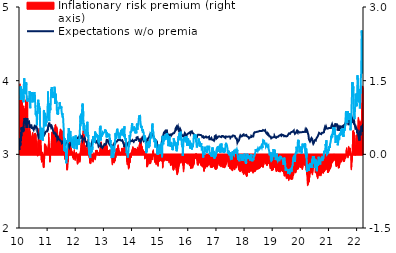
| Category | Inflationary risk premium (right axis) |
|---|---|
| 2010-01-01 | 0.437 |
| 2010-01-04 | 1.435 |
| 2010-01-05 | 0.747 |
| 2010-01-06 | 1.172 |
| 2010-01-07 | 0.792 |
| 2010-01-08 | 1.109 |
| 2010-01-11 | 0.759 |
| 2010-01-12 | 0.645 |
| 2010-01-13 | 0.78 |
| 2010-01-14 | 0.892 |
| 2010-01-15 | 1.143 |
| 2010-01-18 | 1.323 |
| 2010-01-19 | 1.054 |
| 2010-01-20 | 0.948 |
| 2010-01-21 | 1.082 |
| 2010-01-22 | 0.902 |
| 2010-01-25 | 1.047 |
| 2010-01-26 | 0.965 |
| 2010-01-27 | 1.144 |
| 2010-01-28 | 0.8 |
| 2010-01-29 | 1.093 |
| 2010-02-01 | 1.084 |
| 2010-02-02 | 0.8 |
| 2010-02-03 | 0.903 |
| 2010-02-04 | 0.911 |
| 2010-02-05 | 0.894 |
| 2010-02-08 | 0.943 |
| 2010-02-09 | 0.974 |
| 2010-02-10 | 0.783 |
| 2010-02-11 | 0.743 |
| 2010-02-12 | 0.822 |
| 2010-02-15 | 0.922 |
| 2010-02-16 | 0.69 |
| 2010-02-17 | 0.694 |
| 2010-02-18 | 0.587 |
| 2010-02-19 | 0.915 |
| 2010-02-22 | 0.988 |
| 2010-02-23 | 0.779 |
| 2010-02-24 | 0.863 |
| 2010-02-25 | 0.722 |
| 2010-02-26 | 0.819 |
| 2010-03-01 | 0.888 |
| 2010-03-02 | 0.849 |
| 2010-03-03 | 0.8 |
| 2010-03-04 | 0.919 |
| 2010-03-05 | 0.868 |
| 2010-03-08 | 0.931 |
| 2010-03-09 | 0.779 |
| 2010-03-10 | 0.929 |
| 2010-03-11 | 0.758 |
| 2010-03-12 | 0.853 |
| 2010-03-15 | 0.615 |
| 2010-03-16 | 0.704 |
| 2010-03-17 | 0.689 |
| 2010-03-18 | 0.763 |
| 2010-03-19 | 1.072 |
| 2010-03-22 | 1.111 |
| 2010-03-23 | 1.083 |
| 2010-03-24 | 0.844 |
| 2010-03-25 | 0.927 |
| 2010-03-26 | 0.847 |
| 2010-03-29 | 0.821 |
| 2010-03-30 | 0.89 |
| 2010-03-31 | 1.185 |
| 2010-04-01 | 0.962 |
| 2010-04-02 | 0.962 |
| 2010-04-05 | 0.898 |
| 2010-04-06 | 0.86 |
| 2010-04-07 | 0.802 |
| 2010-04-08 | 0.709 |
| 2010-04-09 | 0.594 |
| 2010-04-12 | 1.137 |
| 2010-04-13 | 0.524 |
| 2010-04-14 | 0.622 |
| 2010-04-15 | 0.427 |
| 2010-04-16 | 0.212 |
| 2010-04-19 | 0.152 |
| 2010-04-20 | 0.221 |
| 2010-04-21 | 0.225 |
| 2010-04-22 | 0.392 |
| 2010-04-23 | 0.349 |
| 2010-04-26 | 0.366 |
| 2010-04-27 | 0.374 |
| 2010-04-28 | 0.43 |
| 2010-04-29 | 0.397 |
| 2010-04-30 | 0.475 |
| 2010-05-03 | 0.615 |
| 2010-05-04 | 0.496 |
| 2010-05-05 | 0.511 |
| 2010-05-06 | 0.608 |
| 2010-05-07 | 0.44 |
| 2010-05-10 | 0.519 |
| 2010-05-11 | 0.434 |
| 2010-05-12 | 0.437 |
| 2010-05-13 | 0.46 |
| 2010-05-14 | 0.428 |
| 2010-05-17 | 0.461 |
| 2010-05-18 | 0.411 |
| 2010-05-19 | 0.414 |
| 2010-05-20 | 0.389 |
| 2010-05-21 | 0.389 |
| 2010-05-24 | 0.229 |
| 2010-05-25 | 0.184 |
| 2010-05-26 | 0.168 |
| 2010-05-27 | 0.237 |
| 2010-05-28 | 0.24 |
| 2010-05-31 | 0.233 |
| 2010-06-01 | 0.229 |
| 2010-06-02 | 0.276 |
| 2010-06-03 | 0.297 |
| 2010-06-04 | 0.28 |
| 2010-06-07 | 0.327 |
| 2010-06-08 | 0.325 |
| 2010-06-09 | 0.33 |
| 2010-06-10 | 0.367 |
| 2010-06-11 | 0.369 |
| 2010-06-14 | 0.385 |
| 2010-06-15 | 0.358 |
| 2010-06-16 | 0.432 |
| 2010-06-17 | 0.445 |
| 2010-06-18 | 0.415 |
| 2010-06-21 | 0.397 |
| 2010-06-22 | 0.313 |
| 2010-06-23 | 0.291 |
| 2010-06-24 | 0.332 |
| 2010-06-25 | 0.332 |
| 2010-06-28 | 0.332 |
| 2010-06-29 | 0.322 |
| 2010-06-30 | 0.313 |
| 2010-07-01 | 0.319 |
| 2010-07-02 | 0.325 |
| 2010-07-05 | 0.308 |
| 2010-07-06 | 0.307 |
| 2010-07-07 | 0.362 |
| 2010-07-08 | 0.346 |
| 2010-07-09 | 0.359 |
| 2010-07-12 | 0.369 |
| 2010-07-13 | 0.413 |
| 2010-07-14 | 0.416 |
| 2010-07-15 | 0.418 |
| 2010-07-16 | 0.418 |
| 2010-07-19 | 0.415 |
| 2010-07-20 | 0.427 |
| 2010-07-21 | 0.43 |
| 2010-07-22 | 0.418 |
| 2010-07-23 | 0.414 |
| 2010-07-26 | 0.412 |
| 2010-07-27 | 0.409 |
| 2010-07-28 | 0.392 |
| 2010-07-29 | 0.286 |
| 2010-07-30 | 0.278 |
| 2010-08-02 | 0.273 |
| 2010-08-03 | 0.169 |
| 2010-08-04 | 0.148 |
| 2010-08-05 | 0.148 |
| 2010-08-06 | 0.112 |
| 2010-08-09 | 0.156 |
| 2010-08-10 | 0.147 |
| 2010-08-11 | 0.064 |
| 2010-08-12 | 0.052 |
| 2010-08-13 | 0.091 |
| 2010-08-16 | 0.067 |
| 2010-08-17 | 0.08 |
| 2010-08-18 | 0.075 |
| 2010-08-19 | -0.002 |
| 2010-08-20 | -0.025 |
| 2010-08-23 | -0.024 |
| 2010-08-24 | 0.074 |
| 2010-08-25 | 0.127 |
| 2010-08-26 | 0.226 |
| 2010-08-27 | 0.262 |
| 2010-08-30 | 0.276 |
| 2010-08-31 | 0.316 |
| 2010-09-01 | 0.39 |
| 2010-09-02 | 0.368 |
| 2010-09-03 | 0.406 |
| 2010-09-06 | 0.46 |
| 2010-09-07 | 0.491 |
| 2010-09-08 | 0.527 |
| 2010-09-09 | 0.493 |
| 2010-09-10 | 0.489 |
| 2010-09-13 | 0.495 |
| 2010-09-14 | 0.499 |
| 2010-09-15 | 0.432 |
| 2010-09-16 | 0.477 |
| 2010-09-17 | 0.477 |
| 2010-09-20 | 0.477 |
| 2010-09-21 | 0.415 |
| 2010-09-22 | 0.408 |
| 2010-09-23 | 0.346 |
| 2010-09-24 | 0.388 |
| 2010-09-27 | 0.426 |
| 2010-09-28 | 0.424 |
| 2010-09-29 | 0.354 |
| 2010-09-30 | 0.166 |
| 2010-10-01 | 0.187 |
| 2010-10-04 | 0.115 |
| 2010-10-05 | 0.044 |
| 2010-10-06 | 0.015 |
| 2010-10-07 | -0.025 |
| 2010-10-08 | -0.108 |
| 2010-10-11 | -0.108 |
| 2010-10-12 | -0.126 |
| 2010-10-13 | -0.15 |
| 2010-10-14 | -0.147 |
| 2010-10-15 | -0.139 |
| 2010-10-18 | -0.131 |
| 2010-10-19 | -0.082 |
| 2010-10-20 | -0.012 |
| 2010-10-21 | 0.041 |
| 2010-10-22 | 0.046 |
| 2010-10-25 | -0.012 |
| 2010-10-26 | -0.063 |
| 2010-10-27 | -0.116 |
| 2010-10-28 | -0.097 |
| 2010-10-29 | -0.084 |
| 2010-11-01 | -0.084 |
| 2010-11-02 | -0.124 |
| 2010-11-03 | -0.219 |
| 2010-11-04 | -0.256 |
| 2010-11-05 | -0.254 |
| 2010-11-08 | -0.26 |
| 2010-11-09 | -0.26 |
| 2010-11-10 | -0.195 |
| 2010-11-11 | -0.159 |
| 2010-11-12 | -0.071 |
| 2010-11-15 | -0.091 |
| 2010-11-16 | -0.087 |
| 2010-11-17 | -0.08 |
| 2010-11-18 | 0.054 |
| 2010-11-19 | 0.198 |
| 2010-11-22 | 0.218 |
| 2010-11-23 | 0.167 |
| 2010-11-24 | 0.138 |
| 2010-11-25 | 0.14 |
| 2010-11-26 | 0.158 |
| 2010-11-29 | 0.163 |
| 2010-11-30 | 0.2 |
| 2010-12-01 | 0.178 |
| 2010-12-02 | 0.196 |
| 2010-12-03 | 0.163 |
| 2010-12-06 | 0.169 |
| 2010-12-07 | 0.115 |
| 2010-12-08 | 0.115 |
| 2010-12-09 | 0.145 |
| 2010-12-10 | 0.008 |
| 2010-12-13 | 0.014 |
| 2010-12-14 | 0.062 |
| 2010-12-15 | 0.123 |
| 2010-12-16 | 0.149 |
| 2010-12-17 | 0.113 |
| 2010-12-20 | 0.118 |
| 2010-12-21 | 0.079 |
| 2010-12-22 | 0.064 |
| 2010-12-23 | 0.039 |
| 2010-12-24 | 0.036 |
| 2010-12-27 | 0.061 |
| 2010-12-28 | 0.057 |
| 2010-12-29 | 0.081 |
| 2010-12-30 | 0.079 |
| 2010-12-31 | 0.079 |
| 2011-01-03 | 0.08 |
| 2011-01-04 | 0.114 |
| 2011-01-05 | 0.16 |
| 2011-01-06 | 0.136 |
| 2011-01-07 | 0.197 |
| 2011-01-10 | 0.219 |
| 2011-01-11 | 0.268 |
| 2011-01-12 | 0.432 |
| 2011-01-13 | 0.348 |
| 2011-01-14 | 0.215 |
| 2011-01-17 | 0.206 |
| 2011-01-18 | 0.136 |
| 2011-01-19 | 0.061 |
| 2011-01-20 | -0.005 |
| 2011-01-21 | 0 |
| 2011-01-24 | -0.012 |
| 2011-01-25 | -0.093 |
| 2011-01-26 | -0.12 |
| 2011-01-27 | -0.143 |
| 2011-01-28 | -0.149 |
| 2011-01-31 | -0.127 |
| 2011-02-01 | -0.094 |
| 2011-02-02 | -0.093 |
| 2011-02-03 | 0.069 |
| 2011-02-04 | 0.105 |
| 2011-02-07 | 0.125 |
| 2011-02-08 | 0.102 |
| 2011-02-09 | 0.078 |
| 2011-02-10 | 0.077 |
| 2011-02-11 | 0.09 |
| 2011-02-14 | 0.112 |
| 2011-02-15 | 0.119 |
| 2011-02-16 | 0.228 |
| 2011-02-17 | 0.275 |
| 2011-02-18 | 0.312 |
| 2011-02-21 | 0.368 |
| 2011-02-22 | 0.455 |
| 2011-02-23 | 0.415 |
| 2011-02-24 | 0.42 |
| 2011-02-25 | 0.397 |
| 2011-02-28 | 0.408 |
| 2011-03-01 | 0.444 |
| 2011-03-02 | 0.449 |
| 2011-03-03 | 0.419 |
| 2011-03-04 | 0.35 |
| 2011-03-07 | 0.331 |
| 2011-03-08 | 0.34 |
| 2011-03-09 | 0.324 |
| 2011-03-10 | 0.352 |
| 2011-03-11 | 0.387 |
| 2011-03-14 | 0.445 |
| 2011-03-15 | 0.479 |
| 2011-03-16 | 0.461 |
| 2011-03-17 | 0.478 |
| 2011-03-18 | 0.456 |
| 2011-03-21 | 0.472 |
| 2011-03-22 | 0.46 |
| 2011-03-23 | 0.472 |
| 2011-03-24 | 0.461 |
| 2011-03-25 | 0.479 |
| 2011-03-28 | 0.495 |
| 2011-03-29 | 0.516 |
| 2011-03-30 | 0.514 |
| 2011-03-31 | 0.484 |
| 2011-04-01 | 0.516 |
| 2011-04-04 | 0.534 |
| 2011-04-05 | 0.528 |
| 2011-04-06 | 0.554 |
| 2011-04-07 | 0.599 |
| 2011-04-08 | 0.597 |
| 2011-04-11 | 0.609 |
| 2011-04-12 | 0.498 |
| 2011-04-13 | 0.438 |
| 2011-04-14 | 0.415 |
| 2011-04-15 | 0.387 |
| 2011-04-18 | 0.408 |
| 2011-04-19 | 0.491 |
| 2011-04-20 | 0.542 |
| 2011-04-21 | 0.543 |
| 2011-04-22 | 0.543 |
| 2011-04-25 | 0.54 |
| 2011-04-26 | 0.564 |
| 2011-04-27 | 0.528 |
| 2011-04-28 | 0.495 |
| 2011-04-29 | 0.456 |
| 2011-05-02 | 0.471 |
| 2011-05-03 | 0.475 |
| 2011-05-04 | 0.451 |
| 2011-05-05 | 0.394 |
| 2011-05-06 | 0.348 |
| 2011-05-09 | 0.33 |
| 2011-05-10 | 0.357 |
| 2011-05-11 | 0.327 |
| 2011-05-12 | 0.349 |
| 2011-05-13 | 0.346 |
| 2011-05-16 | 0.337 |
| 2011-05-17 | 0.337 |
| 2011-05-18 | 0.342 |
| 2011-05-19 | 0.319 |
| 2011-05-20 | 0.297 |
| 2011-05-23 | 0.291 |
| 2011-05-24 | 0.285 |
| 2011-05-25 | 0.277 |
| 2011-05-26 | 0.286 |
| 2011-05-27 | 0.37 |
| 2011-05-30 | 0.386 |
| 2011-05-31 | 0.389 |
| 2011-06-01 | 0.386 |
| 2011-06-02 | 0.409 |
| 2011-06-03 | 0.418 |
| 2011-06-06 | 0.426 |
| 2011-06-07 | 0.431 |
| 2011-06-08 | 0.427 |
| 2011-06-09 | 0.461 |
| 2011-06-10 | 0.463 |
| 2011-06-13 | 0.514 |
| 2011-06-14 | 0.516 |
| 2011-06-15 | 0.486 |
| 2011-06-16 | 0.483 |
| 2011-06-17 | 0.49 |
| 2011-06-20 | 0.49 |
| 2011-06-21 | 0.494 |
| 2011-06-22 | 0.472 |
| 2011-06-23 | 0.459 |
| 2011-06-24 | 0.453 |
| 2011-06-27 | 0.453 |
| 2011-06-28 | 0.446 |
| 2011-06-29 | 0.444 |
| 2011-06-30 | 0.463 |
| 2011-07-01 | 0.463 |
| 2011-07-04 | 0.456 |
| 2011-07-05 | 0.478 |
| 2011-07-06 | 0.46 |
| 2011-07-07 | 0.427 |
| 2011-07-08 | 0.404 |
| 2011-07-11 | 0.388 |
| 2011-07-12 | 0.383 |
| 2011-07-13 | 0.395 |
| 2011-07-14 | 0.378 |
| 2011-07-15 | 0.374 |
| 2011-07-18 | 0.391 |
| 2011-07-19 | 0.411 |
| 2011-07-20 | 0.377 |
| 2011-07-21 | 0.364 |
| 2011-07-22 | 0.326 |
| 2011-07-25 | 0.334 |
| 2011-07-26 | 0.348 |
| 2011-07-27 | 0.333 |
| 2011-07-28 | 0.313 |
| 2011-07-29 | 0.273 |
| 2011-08-01 | 0.257 |
| 2011-08-02 | 0.23 |
| 2011-08-03 | 0.196 |
| 2011-08-04 | 0.132 |
| 2011-08-05 | 0.083 |
| 2011-08-08 | 0.064 |
| 2011-08-09 | 0.017 |
| 2011-08-10 | -0.093 |
| 2011-08-11 | -0.038 |
| 2011-08-12 | 0.017 |
| 2011-08-15 | 0.017 |
| 2011-08-16 | 0.041 |
| 2011-08-17 | 0.096 |
| 2011-08-18 | 0.055 |
| 2011-08-19 | -0.081 |
| 2011-08-22 | -0.03 |
| 2011-08-23 | -0.069 |
| 2011-08-24 | -0.071 |
| 2011-08-25 | -0.103 |
| 2011-08-26 | -0.092 |
| 2011-08-29 | -0.06 |
| 2011-08-30 | -0.079 |
| 2011-08-31 | -0.068 |
| 2011-09-01 | -0.075 |
| 2011-09-02 | -0.136 |
| 2011-09-05 | -0.236 |
| 2011-09-06 | -0.312 |
| 2011-09-07 | -0.302 |
| 2011-09-08 | -0.29 |
| 2011-09-09 | -0.249 |
| 2011-09-12 | -0.299 |
| 2011-09-13 | -0.261 |
| 2011-09-14 | -0.199 |
| 2011-09-15 | -0.155 |
| 2011-09-16 | -0.137 |
| 2011-09-19 | -0.137 |
| 2011-09-20 | -0.087 |
| 2011-09-21 | 0.013 |
| 2011-09-22 | 0.009 |
| 2011-09-23 | 0.022 |
| 2011-09-26 | -0.028 |
| 2011-09-27 | -0.025 |
| 2011-09-28 | -0.017 |
| 2011-09-29 | 0.051 |
| 2011-09-30 | 0.128 |
| 2011-10-03 | 0.117 |
| 2011-10-04 | 0.087 |
| 2011-10-05 | 0.144 |
| 2011-10-06 | 0.18 |
| 2011-10-07 | 0.235 |
| 2011-10-10 | 0.235 |
| 2011-10-11 | 0.256 |
| 2011-10-12 | 0.22 |
| 2011-10-13 | 0.2 |
| 2011-10-14 | 0.177 |
| 2011-10-17 | 0.112 |
| 2011-10-18 | 0.051 |
| 2011-10-19 | 0.038 |
| 2011-10-20 | -0.005 |
| 2011-10-21 | 0.032 |
| 2011-10-24 | 0.062 |
| 2011-10-25 | 0.054 |
| 2011-10-26 | 0.044 |
| 2011-10-27 | 0.163 |
| 2011-10-28 | 0.114 |
| 2011-10-31 | 0.114 |
| 2011-11-01 | 0.114 |
| 2011-11-02 | 0.082 |
| 2011-11-03 | 0.068 |
| 2011-11-04 | 0.06 |
| 2011-11-07 | 0.073 |
| 2011-11-08 | 0.053 |
| 2011-11-09 | 0.055 |
| 2011-11-10 | 0.042 |
| 2011-11-11 | 0.037 |
| 2011-11-14 | 0.01 |
| 2011-11-15 | -0.01 |
| 2011-11-16 | 0.029 |
| 2011-11-17 | -0.004 |
| 2011-11-18 | -0.033 |
| 2011-11-21 | 0.013 |
| 2011-11-22 | -0.042 |
| 2011-11-23 | -0.058 |
| 2011-11-24 | -0.061 |
| 2011-11-25 | -0.05 |
| 2011-11-28 | -0.053 |
| 2011-11-29 | -0.095 |
| 2011-11-30 | -0.08 |
| 2011-12-01 | 0.014 |
| 2011-12-02 | 0.023 |
| 2011-12-05 | 0.025 |
| 2011-12-06 | 0.013 |
| 2011-12-07 | 0.052 |
| 2011-12-08 | 0.052 |
| 2011-12-09 | 0.096 |
| 2011-12-12 | 0.012 |
| 2011-12-13 | -0.006 |
| 2011-12-14 | -0.018 |
| 2011-12-15 | -0.033 |
| 2011-12-16 | -0.039 |
| 2011-12-19 | -0.044 |
| 2011-12-20 | -0.093 |
| 2011-12-21 | -0.117 |
| 2011-12-22 | -0.095 |
| 2011-12-23 | -0.086 |
| 2011-12-26 | -0.085 |
| 2011-12-27 | -0.074 |
| 2011-12-28 | -0.052 |
| 2011-12-29 | -0.033 |
| 2011-12-30 | -0.034 |
| 2012-01-02 | 0.013 |
| 2012-01-03 | 0.039 |
| 2012-01-04 | 0.022 |
| 2012-01-05 | 0.04 |
| 2012-01-06 | 0.017 |
| 2012-01-09 | -0.009 |
| 2012-01-10 | -0.021 |
| 2012-01-11 | -0.019 |
| 2012-01-12 | -0.019 |
| 2012-01-13 | -0.014 |
| 2012-01-16 | -0.009 |
| 2012-01-17 | -0.07 |
| 2012-01-18 | -0.134 |
| 2012-01-19 | -0.17 |
| 2012-01-20 | -0.192 |
| 2012-01-23 | -0.186 |
| 2012-01-24 | -0.162 |
| 2012-01-25 | -0.164 |
| 2012-01-26 | -0.114 |
| 2012-01-27 | -0.048 |
| 2012-01-30 | -0.107 |
| 2012-01-31 | -0.061 |
| 2012-02-01 | -0.09 |
| 2012-02-02 | -0.062 |
| 2012-02-03 | -0.093 |
| 2012-02-06 | -0.086 |
| 2012-02-07 | -0.08 |
| 2012-02-08 | -0.093 |
| 2012-02-09 | -0.11 |
| 2012-02-10 | -0.118 |
| 2012-02-13 | -0.123 |
| 2012-02-14 | -0.108 |
| 2012-02-15 | -0.115 |
| 2012-02-16 | -0.127 |
| 2012-02-17 | -0.138 |
| 2012-02-20 | -0.151 |
| 2012-02-21 | -0.087 |
| 2012-02-22 | -0.106 |
| 2012-02-23 | -0.062 |
| 2012-02-24 | 0.019 |
| 2012-02-27 | 0.04 |
| 2012-02-28 | 0.075 |
| 2012-02-29 | 0.052 |
| 2012-03-01 | 0.04 |
| 2012-03-02 | 0.069 |
| 2012-03-05 | 0.121 |
| 2012-03-06 | 0.091 |
| 2012-03-07 | 0.126 |
| 2012-03-08 | 0.238 |
| 2012-03-09 | 0.198 |
| 2012-03-12 | 0.148 |
| 2012-03-13 | 0.181 |
| 2012-03-14 | 0.287 |
| 2012-03-15 | 0.217 |
| 2012-03-16 | 0.21 |
| 2012-03-19 | 0.258 |
| 2012-03-20 | 0.23 |
| 2012-03-21 | 0.171 |
| 2012-03-22 | 0.138 |
| 2012-03-23 | 0.16 |
| 2012-03-26 | 0.143 |
| 2012-03-27 | 0.133 |
| 2012-03-28 | 0.129 |
| 2012-03-29 | 0.195 |
| 2012-03-30 | 0.349 |
| 2012-04-02 | 0.42 |
| 2012-04-03 | 0.402 |
| 2012-04-04 | 0.438 |
| 2012-04-05 | 0.483 |
| 2012-04-06 | 0.483 |
| 2012-04-09 | 0.483 |
| 2012-04-10 | 0.427 |
| 2012-04-11 | 0.366 |
| 2012-04-12 | 0.382 |
| 2012-04-13 | 0.292 |
| 2012-04-16 | 0.226 |
| 2012-04-17 | 0.191 |
| 2012-04-18 | 0.145 |
| 2012-04-19 | 0.087 |
| 2012-04-20 | 0.149 |
| 2012-04-23 | 0.153 |
| 2012-04-24 | 0.194 |
| 2012-04-25 | 0.139 |
| 2012-04-26 | 0.137 |
| 2012-04-27 | 0.169 |
| 2012-04-30 | 0.17 |
| 2012-05-01 | 0.17 |
| 2012-05-02 | 0.104 |
| 2012-05-03 | 0.043 |
| 2012-05-04 | 0.027 |
| 2012-05-07 | 0.093 |
| 2012-05-08 | 0.093 |
| 2012-05-09 | 0.087 |
| 2012-05-10 | 0.112 |
| 2012-05-11 | 0.112 |
| 2012-05-14 | 0.13 |
| 2012-05-15 | 0.084 |
| 2012-05-16 | 0.079 |
| 2012-05-17 | 0.085 |
| 2012-05-18 | 0.128 |
| 2012-05-21 | 0.128 |
| 2012-05-22 | 0.134 |
| 2012-05-23 | 0.058 |
| 2012-05-24 | 0.045 |
| 2012-05-25 | 0.093 |
| 2012-05-28 | 0.098 |
| 2012-05-29 | 0.156 |
| 2012-05-30 | 0.131 |
| 2012-05-31 | 0.159 |
| 2012-06-01 | 0.252 |
| 2012-06-04 | 0.288 |
| 2012-06-05 | 0.31 |
| 2012-06-06 | 0.297 |
| 2012-06-07 | 0.29 |
| 2012-06-08 | 0.274 |
| 2012-06-11 | 0.243 |
| 2012-06-12 | 0.177 |
| 2012-06-13 | 0.127 |
| 2012-06-14 | 0.071 |
| 2012-06-15 | 0.064 |
| 2012-06-18 | 0.097 |
| 2012-06-19 | 0.043 |
| 2012-06-20 | 0.018 |
| 2012-06-21 | -0.055 |
| 2012-06-22 | -0.053 |
| 2012-06-25 | -0.071 |
| 2012-06-26 | -0.073 |
| 2012-06-27 | -0.136 |
| 2012-06-28 | -0.169 |
| 2012-06-29 | -0.075 |
| 2012-07-02 | -0.075 |
| 2012-07-03 | -0.013 |
| 2012-07-04 | -0.048 |
| 2012-07-05 | -0.18 |
| 2012-07-06 | -0.136 |
| 2012-07-09 | -0.126 |
| 2012-07-10 | -0.101 |
| 2012-07-11 | -0.12 |
| 2012-07-12 | -0.174 |
| 2012-07-13 | -0.087 |
| 2012-07-16 | -0.087 |
| 2012-07-17 | -0.041 |
| 2012-07-18 | -0.01 |
| 2012-07-19 | -0.093 |
| 2012-07-20 | -0.109 |
| 2012-07-23 | -0.111 |
| 2012-07-24 | -0.104 |
| 2012-07-25 | -0.103 |
| 2012-07-26 | -0.128 |
| 2012-07-27 | -0.034 |
| 2012-07-30 | -0.031 |
| 2012-07-31 | -0.123 |
| 2012-08-01 | -0.115 |
| 2012-08-02 | -0.091 |
| 2012-08-03 | -0.064 |
| 2012-08-06 | -0.116 |
| 2012-08-07 | -0.12 |
| 2012-08-08 | -0.1 |
| 2012-08-09 | -0.15 |
| 2012-08-10 | -0.131 |
| 2012-08-13 | -0.126 |
| 2012-08-14 | -0.076 |
| 2012-08-15 | -0.076 |
| 2012-08-16 | -0.011 |
| 2012-08-17 | -0.044 |
| 2012-08-20 | -0.028 |
| 2012-08-21 | 0.033 |
| 2012-08-22 | 0.011 |
| 2012-08-23 | -0.02 |
| 2012-08-24 | -0.065 |
| 2012-08-27 | -0.048 |
| 2012-08-28 | -0.035 |
| 2012-08-29 | -0.055 |
| 2012-08-30 | -0.049 |
| 2012-08-31 | -0.044 |
| 2012-09-03 | -0.072 |
| 2012-09-04 | -0.081 |
| 2012-09-05 | -0.105 |
| 2012-09-06 | -0.064 |
| 2012-09-07 | -0.076 |
| 2012-09-10 | -0.072 |
| 2012-09-11 | -0.049 |
| 2012-09-12 | 0.004 |
| 2012-09-13 | 0.028 |
| 2012-09-14 | 0.079 |
| 2012-09-17 | 0.079 |
| 2012-09-18 | 0.079 |
| 2012-09-19 | 0.079 |
| 2012-09-20 | 0.069 |
| 2012-09-21 | 0.053 |
| 2012-09-24 | 0.046 |
| 2012-09-25 | 0.042 |
| 2012-09-26 | 0.048 |
| 2012-09-27 | 0.081 |
| 2012-09-28 | 0.082 |
| 2012-10-01 | 0.08 |
| 2012-10-02 | 0.056 |
| 2012-10-03 | 0.056 |
| 2012-10-04 | 0.048 |
| 2012-10-05 | 0.044 |
| 2012-10-08 | 0.053 |
| 2012-10-09 | 0.017 |
| 2012-10-10 | 0.022 |
| 2012-10-11 | 0.042 |
| 2012-10-12 | 0.03 |
| 2012-10-15 | 0.03 |
| 2012-10-16 | 0.008 |
| 2012-10-17 | 0.006 |
| 2012-10-18 | 0.007 |
| 2012-10-19 | 0.001 |
| 2012-10-22 | 0.014 |
| 2012-10-23 | 0.009 |
| 2012-10-24 | 0.006 |
| 2012-10-25 | 0.03 |
| 2012-10-26 | -0.008 |
| 2012-10-29 | -0.01 |
| 2012-10-30 | 0 |
| 2012-10-31 | -0.003 |
| 2012-11-01 | -0.003 |
| 2012-11-02 | -0.003 |
| 2012-11-05 | 0.023 |
| 2012-11-06 | 0.043 |
| 2012-11-07 | 0.032 |
| 2012-11-08 | 0.093 |
| 2012-11-09 | 0.061 |
| 2012-11-12 | 0.078 |
| 2012-11-13 | 0.138 |
| 2012-11-14 | 0.156 |
| 2012-11-15 | 0.172 |
| 2012-11-16 | 0.222 |
| 2012-11-19 | 0.219 |
| 2012-11-20 | 0.179 |
| 2012-11-21 | 0.218 |
| 2012-11-22 | 0.238 |
| 2012-11-23 | 0.254 |
| 2012-11-26 | 0.214 |
| 2012-11-27 | 0.047 |
| 2012-11-28 | 0.002 |
| 2012-11-29 | 0.019 |
| 2012-11-30 | 0.044 |
| 2012-12-03 | 0.048 |
| 2012-12-04 | 0.065 |
| 2012-12-05 | 0.072 |
| 2012-12-06 | 0.105 |
| 2012-12-07 | 0.091 |
| 2012-12-10 | 0.112 |
| 2012-12-11 | 0.116 |
| 2012-12-12 | 0.122 |
| 2012-12-13 | 0.158 |
| 2012-12-14 | 0.143 |
| 2012-12-17 | 0.155 |
| 2012-12-18 | 0.158 |
| 2012-12-19 | 0.158 |
| 2012-12-20 | 0.171 |
| 2012-12-21 | 0.169 |
| 2012-12-24 | 0.166 |
| 2012-12-25 | 0.166 |
| 2012-12-26 | 0.148 |
| 2012-12-27 | 0.145 |
| 2012-12-28 | 0.143 |
| 2012-12-31 | 0.143 |
| 2013-01-01 | 0.143 |
| 2013-01-02 | 0.135 |
| 2013-01-03 | 0.149 |
| 2013-01-04 | 0.163 |
| 2013-01-07 | 0.158 |
| 2013-01-08 | 0.129 |
| 2013-01-09 | 0.133 |
| 2013-01-10 | 0.141 |
| 2013-01-11 | 0.149 |
| 2013-01-14 | 0.142 |
| 2013-01-15 | 0.142 |
| 2013-01-16 | 0.14 |
| 2013-01-17 | 0.138 |
| 2013-01-18 | 0.15 |
| 2013-01-21 | 0.148 |
| 2013-01-22 | 0.18 |
| 2013-01-23 | 0.192 |
| 2013-01-24 | 0.142 |
| 2013-01-25 | 0.145 |
| 2013-01-28 | 0.184 |
| 2013-01-29 | 0.197 |
| 2013-01-30 | 0.2 |
| 2013-01-31 | 0.199 |
| 2013-02-01 | 0.174 |
| 2013-02-04 | 0.166 |
| 2013-02-05 | 0.161 |
| 2013-02-06 | 0.138 |
| 2013-02-07 | 0.103 |
| 2013-02-08 | 0.078 |
| 2013-02-11 | 0.058 |
| 2013-02-12 | 0.006 |
| 2013-02-13 | 0.059 |
| 2013-02-14 | 0.078 |
| 2013-02-15 | 0.061 |
| 2013-02-18 | 0.073 |
| 2013-02-19 | 0.078 |
| 2013-02-20 | 0.079 |
| 2013-02-21 | 0.05 |
| 2013-02-22 | 0.043 |
| 2013-02-25 | 0.024 |
| 2013-02-26 | 0.016 |
| 2013-02-27 | 0.031 |
| 2013-02-28 | 0.05 |
| 2013-03-01 | 0.035 |
| 2013-03-04 | 0.041 |
| 2013-03-05 | 0.056 |
| 2013-03-06 | 0.079 |
| 2013-03-07 | 0.077 |
| 2013-03-08 | 0.064 |
| 2013-03-11 | 0.058 |
| 2013-03-12 | 0.082 |
| 2013-03-13 | 0.056 |
| 2013-03-14 | 0.058 |
| 2013-03-15 | 0.077 |
| 2013-03-18 | 0.099 |
| 2013-03-19 | 0.08 |
| 2013-03-20 | 0.07 |
| 2013-03-21 | 0.068 |
| 2013-03-22 | 0.049 |
| 2013-03-25 | 0.065 |
| 2013-03-26 | 0.056 |
| 2013-03-27 | 0.049 |
| 2013-03-28 | 0.001 |
| 2013-03-29 | 0.001 |
| 2013-04-01 | 0.03 |
| 2013-04-02 | 0.049 |
| 2013-04-03 | 0.062 |
| 2013-04-04 | 0.012 |
| 2013-04-05 | -0.028 |
| 2013-04-08 | -0.043 |
| 2013-04-09 | -0.051 |
| 2013-04-10 | -0.061 |
| 2013-04-11 | -0.062 |
| 2013-04-12 | -0.02 |
| 2013-04-15 | -0.046 |
| 2013-04-16 | -0.179 |
| 2013-04-17 | -0.208 |
| 2013-04-18 | -0.145 |
| 2013-04-19 | -0.123 |
| 2013-04-22 | -0.1 |
| 2013-04-23 | -0.097 |
| 2013-04-24 | -0.083 |
| 2013-04-25 | -0.113 |
| 2013-04-26 | -0.132 |
| 2013-04-29 | -0.148 |
| 2013-04-30 | -0.157 |
| 2013-05-01 | -0.157 |
| 2013-05-02 | -0.132 |
| 2013-05-03 | -0.098 |
| 2013-05-06 | -0.048 |
| 2013-05-07 | -0.045 |
| 2013-05-08 | -0.151 |
| 2013-05-09 | -0.168 |
| 2013-05-10 | -0.096 |
| 2013-05-13 | -0.045 |
| 2013-05-14 | -0.003 |
| 2013-05-15 | -0.019 |
| 2013-05-16 | -0.072 |
| 2013-05-17 | -0.061 |
| 2013-05-20 | -0.128 |
| 2013-05-21 | -0.128 |
| 2013-05-22 | -0.089 |
| 2013-05-23 | -0.082 |
| 2013-05-24 | -0.065 |
| 2013-05-27 | -0.073 |
| 2013-05-28 | -0.053 |
| 2013-05-29 | -0.059 |
| 2013-05-30 | -0.056 |
| 2013-05-31 | -0.034 |
| 2013-06-03 | 0.052 |
| 2013-06-04 | 0.08 |
| 2013-06-05 | 0.066 |
| 2013-06-06 | 0.114 |
| 2013-06-07 | 0.118 |
| 2013-06-10 | 0.055 |
| 2013-06-11 | 0.051 |
| 2013-06-12 | 0.045 |
| 2013-06-13 | 0.009 |
| 2013-06-14 | 0.033 |
| 2013-06-17 | 0.048 |
| 2013-06-18 | 0.071 |
| 2013-06-19 | 0.078 |
| 2013-06-20 | 0.106 |
| 2013-06-21 | 0.088 |
| 2013-06-24 | 0.101 |
| 2013-06-25 | 0.09 |
| 2013-06-26 | 0.084 |
| 2013-06-27 | 0.11 |
| 2013-06-28 | 0.175 |
| 2013-07-01 | 0.195 |
| 2013-07-02 | 0.167 |
| 2013-07-03 | 0.16 |
| 2013-07-04 | 0.156 |
| 2013-07-05 | 0.128 |
| 2013-07-08 | 0.126 |
| 2013-07-09 | 0.092 |
| 2013-07-10 | 0.061 |
| 2013-07-11 | 0.077 |
| 2013-07-12 | 0.065 |
| 2013-07-15 | 0.027 |
| 2013-07-16 | 0.027 |
| 2013-07-17 | 0.027 |
| 2013-07-18 | 0.029 |
| 2013-07-19 | 0.028 |
| 2013-07-22 | 0.02 |
| 2013-07-23 | 0.016 |
| 2013-07-24 | 0.046 |
| 2013-07-25 | 0.02 |
| 2013-07-26 | 0.012 |
| 2013-07-29 | 0.015 |
| 2013-07-30 | -0.01 |
| 2013-07-31 | 0.016 |
| 2013-08-01 | 0.046 |
| 2013-08-02 | 0.016 |
| 2013-08-05 | 0.025 |
| 2013-08-06 | 0.032 |
| 2013-08-07 | 0.04 |
| 2013-08-08 | 0.046 |
| 2013-08-09 | 0.049 |
| 2013-08-12 | 0.052 |
| 2013-08-13 | 0.04 |
| 2013-08-14 | 0.056 |
| 2013-08-15 | 0.056 |
| 2013-08-16 | 0.123 |
| 2013-08-19 | 0.119 |
| 2013-08-20 | 0.121 |
| 2013-08-21 | 0.119 |
| 2013-08-22 | 0.112 |
| 2013-08-23 | 0.091 |
| 2013-08-26 | 0.059 |
| 2013-08-27 | 0.035 |
| 2013-08-28 | 0.029 |
| 2013-08-29 | 0.052 |
| 2013-08-30 | 0.104 |
| 2013-09-02 | 0.086 |
| 2013-09-03 | 0.107 |
| 2013-09-04 | 0.072 |
| 2013-09-05 | 0.136 |
| 2013-09-06 | 0.083 |
| 2013-09-09 | 0.092 |
| 2013-09-10 | 0.115 |
| 2013-09-11 | 0.061 |
| 2013-09-12 | 0.079 |
| 2013-09-13 | 0.05 |
| 2013-09-16 | 0.058 |
| 2013-09-17 | 0.061 |
| 2013-09-18 | 0.061 |
| 2013-09-19 | 0.061 |
| 2013-09-20 | 0.061 |
| 2013-09-23 | 0.059 |
| 2013-09-24 | 0.058 |
| 2013-09-25 | 0.099 |
| 2013-09-26 | 0.152 |
| 2013-09-27 | 0.186 |
| 2013-09-30 | 0.244 |
| 2013-10-01 | 0.202 |
| 2013-10-02 | 0.161 |
| 2013-10-03 | 0.116 |
| 2013-10-04 | 0.075 |
| 2013-10-07 | 0.129 |
| 2013-10-08 | 0.101 |
| 2013-10-09 | 0.044 |
| 2013-10-10 | 0.059 |
| 2013-10-11 | 0.038 |
| 2013-10-14 | 0.042 |
| 2013-10-15 | 0.039 |
| 2013-10-16 | 0.019 |
| 2013-10-17 | 0.02 |
| 2013-10-18 | -0.022 |
| 2013-10-21 | 0.012 |
| 2013-10-22 | -0.048 |
| 2013-10-23 | -0.084 |
| 2013-10-24 | -0.125 |
| 2013-10-25 | -0.147 |
| 2013-10-28 | -0.153 |
| 2013-10-29 | -0.204 |
| 2013-10-30 | -0.196 |
| 2013-10-31 | -0.196 |
| 2013-11-01 | -0.196 |
| 2013-11-04 | -0.16 |
| 2013-11-05 | -0.16 |
| 2013-11-06 | -0.173 |
| 2013-11-07 | -0.164 |
| 2013-11-08 | -0.165 |
| 2013-11-11 | -0.163 |
| 2013-11-12 | -0.235 |
| 2013-11-13 | -0.273 |
| 2013-11-14 | -0.291 |
| 2013-11-15 | -0.26 |
| 2013-11-18 | -0.255 |
| 2013-11-19 | -0.261 |
| 2013-11-20 | -0.237 |
| 2013-11-21 | -0.182 |
| 2013-11-22 | -0.16 |
| 2013-11-25 | -0.15 |
| 2013-11-26 | -0.127 |
| 2013-11-27 | -0.151 |
| 2013-11-28 | -0.149 |
| 2013-11-29 | -0.16 |
| 2013-12-02 | -0.162 |
| 2013-12-03 | -0.091 |
| 2013-12-04 | -0.043 |
| 2013-12-05 | -0.057 |
| 2013-12-06 | 0.027 |
| 2013-12-09 | -0.007 |
| 2013-12-10 | -0.045 |
| 2013-12-11 | -0.061 |
| 2013-12-12 | -0.061 |
| 2013-12-13 | -0.043 |
| 2013-12-16 | -0.052 |
| 2013-12-17 | -0.012 |
| 2013-12-18 | -0.002 |
| 2013-12-19 | 0.012 |
| 2013-12-20 | 0.05 |
| 2013-12-23 | 0.031 |
| 2013-12-24 | 0.04 |
| 2013-12-25 | 0.04 |
| 2013-12-26 | 0.046 |
| 2013-12-27 | 0.059 |
| 2013-12-30 | 0.082 |
| 2013-12-31 | 0.082 |
| 2014-01-01 | 0.082 |
| 2014-01-02 | 0.111 |
| 2014-01-03 | 0.115 |
| 2014-01-06 | 0.103 |
| 2014-01-07 | 0.094 |
| 2014-01-08 | 0.157 |
| 2014-01-09 | 0.14 |
| 2014-01-10 | 0.129 |
| 2014-01-13 | 0.101 |
| 2014-01-14 | 0.068 |
| 2014-01-15 | 0.047 |
| 2014-01-16 | 0.047 |
| 2014-01-17 | 0.021 |
| 2014-01-20 | 0.038 |
| 2014-01-21 | 0.066 |
| 2014-01-22 | 0.043 |
| 2014-01-23 | 0.052 |
| 2014-01-24 | 0.097 |
| 2014-01-27 | 0.087 |
| 2014-01-28 | 0.047 |
| 2014-01-29 | 0.088 |
| 2014-01-30 | 0.118 |
| 2014-01-31 | 0.121 |
| 2014-02-03 | 0.105 |
| 2014-02-04 | 0.112 |
| 2014-02-05 | 0.121 |
| 2014-02-06 | 0.103 |
| 2014-02-07 | 0.113 |
| 2014-02-10 | 0.095 |
| 2014-02-11 | 0.106 |
| 2014-02-12 | 0.055 |
| 2014-02-13 | 0.1 |
| 2014-02-14 | 0.113 |
| 2014-02-17 | 0.083 |
| 2014-02-18 | 0.06 |
| 2014-02-19 | 0.031 |
| 2014-02-20 | 0.023 |
| 2014-02-21 | 0.089 |
| 2014-02-24 | 0.105 |
| 2014-02-25 | 0.098 |
| 2014-02-26 | 0.054 |
| 2014-02-27 | 0.089 |
| 2014-02-28 | 0.1 |
| 2014-03-03 | 0.029 |
| 2014-03-04 | 0.09 |
| 2014-03-05 | 0.08 |
| 2014-03-06 | 0.101 |
| 2014-03-07 | 0.067 |
| 2014-03-10 | 0.105 |
| 2014-03-11 | 0.149 |
| 2014-03-12 | 0.104 |
| 2014-03-13 | 0.123 |
| 2014-03-14 | 0.104 |
| 2014-03-17 | 0.086 |
| 2014-03-18 | 0.078 |
| 2014-03-19 | 0.041 |
| 2014-03-20 | 0.05 |
| 2014-03-21 | 0.078 |
| 2014-03-24 | 0.123 |
| 2014-03-25 | 0.117 |
| 2014-03-26 | 0.123 |
| 2014-03-27 | 0.113 |
| 2014-03-28 | 0.106 |
| 2014-03-31 | 0.13 |
| 2014-04-01 | 0.112 |
| 2014-04-02 | 0.181 |
| 2014-04-03 | 0.184 |
| 2014-04-04 | 0.208 |
| 2014-04-07 | 0.219 |
| 2014-04-08 | 0.281 |
| 2014-04-09 | 0.282 |
| 2014-04-10 | 0.259 |
| 2014-04-11 | 0.244 |
| 2014-04-14 | 0.284 |
| 2014-04-15 | 0.304 |
| 2014-04-16 | 0.319 |
| 2014-04-17 | 0.327 |
| 2014-04-18 | 0.327 |
| 2014-04-21 | 0.322 |
| 2014-04-22 | 0.309 |
| 2014-04-23 | 0.3 |
| 2014-04-24 | 0.277 |
| 2014-04-25 | 0.225 |
| 2014-04-28 | 0.207 |
| 2014-04-29 | 0.183 |
| 2014-04-30 | 0.16 |
| 2014-05-01 | 0.16 |
| 2014-05-02 | 0.156 |
| 2014-05-05 | 0.142 |
| 2014-05-06 | 0.153 |
| 2014-05-07 | 0.163 |
| 2014-05-08 | 0.11 |
| 2014-05-09 | 0.127 |
| 2014-05-12 | 0.109 |
| 2014-05-13 | 0.095 |
| 2014-05-14 | 0.092 |
| 2014-05-15 | 0.1 |
| 2014-05-16 | 0.099 |
| 2014-05-19 | 0.088 |
| 2014-05-20 | 0.046 |
| 2014-05-21 | 0.046 |
| 2014-05-22 | 0.053 |
| 2014-05-23 | 0.079 |
| 2014-05-26 | 0.057 |
| 2014-05-27 | 0.015 |
| 2014-05-28 | 0.006 |
| 2014-05-29 | 0.016 |
| 2014-05-30 | 0.022 |
| 2014-06-02 | 0.027 |
| 2014-06-03 | 0.047 |
| 2014-06-04 | 0.041 |
| 2014-06-05 | 0.06 |
| 2014-06-06 | 0.042 |
| 2014-06-09 | 0.025 |
| 2014-06-10 | -0.007 |
| 2014-06-11 | -0.055 |
| 2014-06-12 | -0.08 |
| 2014-06-13 | -0.085 |
| 2014-06-16 | -0.045 |
| 2014-06-17 | -0.019 |
| 2014-06-18 | -0.018 |
| 2014-06-19 | -0.018 |
| 2014-06-20 | 0.001 |
| 2014-06-23 | 0.006 |
| 2014-06-24 | 0.023 |
| 2014-06-25 | 0.014 |
| 2014-06-26 | 0.029 |
| 2014-06-27 | 0.016 |
| 2014-06-30 | -0.013 |
| 2014-07-01 | -0.065 |
| 2014-07-02 | -0.063 |
| 2014-07-03 | -0.056 |
| 2014-07-04 | -0.079 |
| 2014-07-07 | -0.111 |
| 2014-07-08 | -0.104 |
| 2014-07-09 | -0.217 |
| 2014-07-10 | -0.25 |
| 2014-07-11 | -0.237 |
| 2014-07-14 | -0.191 |
| 2014-07-15 | -0.234 |
| 2014-07-16 | -0.234 |
| 2014-07-17 | -0.232 |
| 2014-07-18 | -0.207 |
| 2014-07-21 | -0.206 |
| 2014-07-22 | -0.135 |
| 2014-07-23 | -0.133 |
| 2014-07-24 | -0.138 |
| 2014-07-25 | -0.142 |
| 2014-07-28 | -0.131 |
| 2014-07-29 | -0.095 |
| 2014-07-30 | -0.129 |
| 2014-07-31 | -0.115 |
| 2014-08-01 | -0.124 |
| 2014-08-04 | -0.119 |
| 2014-08-05 | -0.087 |
| 2014-08-06 | -0.107 |
| 2014-08-07 | -0.118 |
| 2014-08-08 | -0.184 |
| 2014-08-11 | -0.179 |
| 2014-08-12 | -0.165 |
| 2014-08-13 | -0.123 |
| 2014-08-14 | -0.1 |
| 2014-08-15 | -0.1 |
| 2014-08-18 | -0.103 |
| 2014-08-19 | -0.123 |
| 2014-08-20 | -0.134 |
| 2014-08-21 | -0.18 |
| 2014-08-22 | -0.15 |
| 2014-08-25 | -0.153 |
| 2014-08-26 | -0.156 |
| 2014-08-27 | -0.175 |
| 2014-08-28 | -0.147 |
| 2014-08-29 | -0.104 |
| 2014-09-01 | -0.093 |
| 2014-09-02 | -0.09 |
| 2014-09-03 | -0.084 |
| 2014-09-04 | -0.05 |
| 2014-09-05 | -0.062 |
| 2014-09-08 | -0.069 |
| 2014-09-09 | -0.073 |
| 2014-09-10 | -0.093 |
| 2014-09-11 | -0.079 |
| 2014-09-12 | -0.087 |
| 2014-09-15 | -0.104 |
| 2014-09-16 | -0.096 |
| 2014-09-17 | -0.06 |
| 2014-09-18 | -0.06 |
| 2014-09-19 | -0.06 |
| 2014-09-22 | -0.022 |
| 2014-09-23 | 0.015 |
| 2014-09-24 | 0.068 |
| 2014-09-25 | 0.054 |
| 2014-09-26 | 0.029 |
| 2014-09-29 | 0.065 |
| 2014-09-30 | 0.094 |
| 2014-10-01 | 0.06 |
| 2014-10-02 | 0.052 |
| 2014-10-03 | 0.021 |
| 2014-10-06 | -0.007 |
| 2014-10-07 | -0.013 |
| 2014-10-08 | -0.011 |
| 2014-10-09 | -0.031 |
| 2014-10-10 | -0.008 |
| 2014-10-13 | 0.002 |
| 2014-10-14 | -0.038 |
| 2014-10-15 | -0.111 |
| 2014-10-16 | -0.106 |
| 2014-10-17 | -0.082 |
| 2014-10-20 | -0.095 |
| 2014-10-21 | -0.096 |
| 2014-10-22 | -0.155 |
| 2014-10-23 | -0.149 |
| 2014-10-24 | -0.144 |
| 2014-10-27 | -0.161 |
| 2014-10-28 | -0.134 |
| 2014-10-29 | -0.123 |
| 2014-10-30 | -0.113 |
| 2014-10-31 | -0.113 |
| 2014-11-03 | -0.092 |
| 2014-11-04 | -0.108 |
| 2014-11-05 | -0.179 |
| 2014-11-06 | -0.201 |
| 2014-11-07 | -0.169 |
| 2014-11-10 | -0.144 |
| 2014-11-11 | -0.113 |
| 2014-11-12 | -0.085 |
| 2014-11-13 | -0.111 |
| 2014-11-14 | -0.105 |
| 2014-11-17 | -0.117 |
| 2014-11-18 | -0.111 |
| 2014-11-19 | -0.115 |
| 2014-11-20 | -0.143 |
| 2014-11-21 | -0.136 |
| 2014-11-24 | -0.121 |
| 2014-11-25 | -0.133 |
| 2014-11-26 | -0.121 |
| 2014-11-27 | -0.176 |
| 2014-11-28 | -0.219 |
| 2014-12-01 | -0.235 |
| 2014-12-02 | -0.2 |
| 2014-12-03 | -0.141 |
| 2014-12-04 | -0.135 |
| 2014-12-05 | -0.096 |
| 2014-12-08 | -0.096 |
| 2014-12-09 | -0.097 |
| 2014-12-10 | -0.147 |
| 2014-12-11 | -0.144 |
| 2014-12-12 | -0.137 |
| 2014-12-15 | -0.104 |
| 2014-12-16 | -0.1 |
| 2014-12-17 | -0.117 |
| 2014-12-18 | -0.082 |
| 2014-12-19 | -0.085 |
| 2014-12-22 | -0.092 |
| 2014-12-23 | -0.072 |
| 2014-12-24 | -0.041 |
| 2014-12-25 | -0.041 |
| 2014-12-26 | -0.078 |
| 2014-12-29 | -0.095 |
| 2014-12-30 | -0.109 |
| 2014-12-31 | -0.109 |
| 2015-01-01 | -0.109 |
| 2015-01-02 | -0.098 |
| 2015-01-05 | -0.101 |
| 2015-01-06 | -0.12 |
| 2015-01-07 | -0.087 |
| 2015-01-08 | -0.122 |
| 2015-01-09 | -0.098 |
| 2015-01-12 | -0.1 |
| 2015-01-13 | -0.057 |
| 2015-01-14 | -0.054 |
| 2015-01-15 | -0.08 |
| 2015-01-16 | -0.088 |
| 2015-01-19 | -0.087 |
| 2015-01-20 | -0.127 |
| 2015-01-21 | -0.135 |
| 2015-01-22 | -0.033 |
| 2015-01-23 | -0.035 |
| 2015-01-26 | -0.008 |
| 2015-01-27 | -0.059 |
| 2015-01-28 | -0.106 |
| 2015-01-29 | -0.186 |
| 2015-01-30 | -0.271 |
| 2015-02-02 | -0.25 |
| 2015-02-03 | -0.152 |
| 2015-02-04 | -0.134 |
| 2015-02-05 | -0.104 |
| 2015-02-06 | -0.023 |
| 2015-02-09 | 0.002 |
| 2015-02-10 | -0.023 |
| 2015-02-11 | -0.058 |
| 2015-02-12 | -0.062 |
| 2015-02-13 | -0.096 |
| 2015-02-16 | -0.101 |
| 2015-02-17 | -0.132 |
| 2015-02-18 | -0.087 |
| 2015-02-19 | -0.047 |
| 2015-02-20 | -0.02 |
| 2015-02-23 | -0.022 |
| 2015-02-24 | -0.029 |
| 2015-02-25 | -0.078 |
| 2015-02-26 | -0.109 |
| 2015-02-27 | -0.111 |
| 2015-03-02 | -0.079 |
| 2015-03-03 | -0.068 |
| 2015-03-04 | -0.076 |
| 2015-03-05 | -0.089 |
| 2015-03-06 | -0.083 |
| 2015-03-09 | -0.087 |
| 2015-03-10 | -0.108 |
| 2015-03-11 | -0.061 |
| 2015-03-12 | -0.084 |
| 2015-03-13 | -0.071 |
| 2015-03-16 | -0.07 |
| 2015-03-17 | -0.114 |
| 2015-03-18 | -0.101 |
| 2015-03-19 | -0.078 |
| 2015-03-20 | -0.041 |
| 2015-03-23 | -0.059 |
| 2015-03-24 | -0.057 |
| 2015-03-25 | -0.094 |
| 2015-03-26 | -0.118 |
| 2015-03-27 | -0.115 |
| 2015-03-30 | -0.1 |
| 2015-03-31 | -0.115 |
| 2015-04-01 | -0.112 |
| 2015-04-02 | -0.085 |
| 2015-04-03 | -0.085 |
| 2015-04-06 | -0.119 |
| 2015-04-07 | -0.068 |
| 2015-04-08 | -0.067 |
| 2015-04-09 | -0.084 |
| 2015-04-10 | -0.088 |
| 2015-04-13 | -0.079 |
| 2015-04-14 | -0.067 |
| 2015-04-15 | -0.041 |
| 2015-04-16 | -0.029 |
| 2015-04-17 | -0.021 |
| 2015-04-20 | -0.013 |
| 2015-04-21 | -0.115 |
| 2015-04-22 | -0.128 |
| 2015-04-23 | -0.165 |
| 2015-04-24 | -0.131 |
| 2015-04-27 | -0.127 |
| 2015-04-28 | -0.128 |
| 2015-04-29 | -0.115 |
| 2015-04-30 | -0.095 |
| 2015-05-01 | -0.095 |
| 2015-05-04 | -0.117 |
| 2015-05-05 | -0.083 |
| 2015-05-06 | -0.071 |
| 2015-05-07 | -0.094 |
| 2015-05-08 | -0.044 |
| 2015-05-11 | -0.067 |
| 2015-05-12 | -0.189 |
| 2015-05-13 | -0.205 |
| 2015-05-14 | -0.217 |
| 2015-05-15 | -0.218 |
| 2015-05-18 | -0.197 |
| 2015-05-19 | -0.158 |
| 2015-05-20 | -0.131 |
| 2015-05-21 | -0.131 |
| 2015-05-22 | -0.138 |
| 2015-05-25 | -0.178 |
| 2015-05-26 | -0.209 |
| 2015-05-27 | -0.191 |
| 2015-05-28 | -0.157 |
| 2015-05-29 | -0.174 |
| 2015-06-01 | -0.159 |
| 2015-06-02 | -0.13 |
| 2015-06-03 | -0.165 |
| 2015-06-04 | -0.169 |
| 2015-06-05 | -0.184 |
| 2015-06-08 | -0.194 |
| 2015-06-09 | -0.224 |
| 2015-06-10 | -0.216 |
| 2015-06-11 | -0.226 |
| 2015-06-12 | -0.238 |
| 2015-06-15 | -0.274 |
| 2015-06-16 | -0.301 |
| 2015-06-17 | -0.303 |
| 2015-06-18 | -0.316 |
| 2015-06-19 | -0.279 |
| 2015-06-22 | -0.305 |
| 2015-06-23 | -0.289 |
| 2015-06-24 | -0.297 |
| 2015-06-25 | -0.24 |
| 2015-06-26 | -0.238 |
| 2015-06-29 | -0.238 |
| 2015-06-30 | -0.236 |
| 2015-07-01 | -0.19 |
| 2015-07-02 | -0.141 |
| 2015-07-03 | -0.112 |
| 2015-07-06 | -0.164 |
| 2015-07-07 | -0.184 |
| 2015-07-08 | -0.18 |
| 2015-07-09 | -0.186 |
| 2015-07-10 | -0.161 |
| 2015-07-13 | -0.218 |
| 2015-07-14 | -0.246 |
| 2015-07-15 | -0.247 |
| 2015-07-16 | -0.247 |
| 2015-07-17 | -0.254 |
| 2015-07-20 | -0.261 |
| 2015-07-21 | -0.205 |
| 2015-07-22 | -0.247 |
| 2015-07-23 | -0.246 |
| 2015-07-24 | -0.268 |
| 2015-07-27 | -0.314 |
| 2015-07-28 | -0.307 |
| 2015-07-29 | -0.329 |
| 2015-07-30 | -0.295 |
| 2015-07-31 | -0.341 |
| 2015-08-03 | -0.326 |
| 2015-08-04 | -0.32 |
| 2015-08-05 | -0.368 |
| 2015-08-06 | -0.407 |
| 2015-08-07 | -0.401 |
| 2015-08-10 | -0.378 |
| 2015-08-11 | -0.375 |
| 2015-08-12 | -0.381 |
| 2015-08-13 | -0.354 |
| 2015-08-14 | -0.334 |
| 2015-08-17 | -0.34 |
| 2015-08-18 | -0.318 |
| 2015-08-19 | -0.264 |
| 2015-08-20 | -0.282 |
| 2015-08-21 | -0.241 |
| 2015-08-24 | -0.237 |
| 2015-08-25 | -0.282 |
| 2015-08-26 | -0.249 |
| 2015-08-27 | -0.228 |
| 2015-08-28 | -0.205 |
| 2015-08-31 | -0.199 |
| 2015-09-01 | -0.18 |
| 2015-09-02 | -0.14 |
| 2015-09-03 | -0.194 |
| 2015-09-04 | -0.188 |
| 2015-09-07 | -0.171 |
| 2015-09-08 | -0.138 |
| 2015-09-09 | -0.138 |
| 2015-09-10 | -0.149 |
| 2015-09-11 | -0.104 |
| 2015-09-14 | -0.071 |
| 2015-09-15 | -0.105 |
| 2015-09-16 | -0.123 |
| 2015-09-17 | -0.121 |
| 2015-09-18 | -0.121 |
| 2015-09-21 | -0.157 |
| 2015-09-22 | -0.169 |
| 2015-09-23 | -0.147 |
| 2015-09-24 | -0.159 |
| 2015-09-25 | -0.115 |
| 2015-09-28 | -0.078 |
| 2015-09-29 | -0.104 |
| 2015-09-30 | -0.053 |
| 2015-10-01 | -0.079 |
| 2015-10-02 | -0.089 |
| 2015-10-05 | -0.088 |
| 2015-10-06 | -0.079 |
| 2015-10-07 | -0.122 |
| 2015-10-08 | -0.089 |
| 2015-10-09 | -0.124 |
| 2015-10-12 | -0.124 |
| 2015-10-13 | -0.104 |
| 2015-10-14 | -0.132 |
| 2015-10-15 | -0.175 |
| 2015-10-16 | -0.189 |
| 2015-10-19 | -0.199 |
| 2015-10-20 | -0.215 |
| 2015-10-21 | -0.181 |
| 2015-10-22 | -0.18 |
| 2015-10-23 | -0.2 |
| 2015-10-26 | -0.23 |
| 2015-10-27 | -0.284 |
| 2015-10-28 | -0.348 |
| 2015-10-29 | -0.315 |
| 2015-10-30 | -0.284 |
| 2015-11-02 | -0.206 |
| 2015-11-03 | -0.213 |
| 2015-11-04 | -0.184 |
| 2015-11-05 | -0.154 |
| 2015-11-06 | -0.117 |
| 2015-11-09 | -0.119 |
| 2015-11-10 | -0.09 |
| 2015-11-11 | -0.066 |
| 2015-11-12 | -0.073 |
| 2015-11-13 | -0.095 |
| 2015-11-16 | -0.11 |
| 2015-11-17 | -0.142 |
| 2015-11-18 | -0.124 |
| 2015-11-19 | -0.133 |
| 2015-11-20 | -0.153 |
| 2015-11-23 | -0.147 |
| 2015-11-24 | -0.15 |
| 2015-11-25 | -0.154 |
| 2015-11-26 | -0.131 |
| 2015-11-27 | -0.09 |
| 2015-11-30 | -0.138 |
| 2015-12-01 | -0.129 |
| 2015-12-02 | -0.102 |
| 2015-12-03 | -0.126 |
| 2015-12-04 | -0.132 |
| 2015-12-07 | -0.17 |
| 2015-12-08 | -0.17 |
| 2015-12-09 | -0.132 |
| 2015-12-10 | -0.127 |
| 2015-12-11 | -0.124 |
| 2015-12-14 | -0.117 |
| 2015-12-15 | -0.053 |
| 2015-12-16 | -0.055 |
| 2015-12-17 | -0.101 |
| 2015-12-18 | -0.13 |
| 2015-12-21 | -0.141 |
| 2015-12-22 | -0.151 |
| 2015-12-23 | -0.191 |
| 2015-12-24 | -0.136 |
| 2015-12-25 | -0.136 |
| 2015-12-28 | -0.142 |
| 2015-12-29 | -0.138 |
| 2015-12-30 | -0.143 |
| 2015-12-31 | -0.143 |
| 2016-01-01 | -0.143 |
| 2016-01-04 | -0.118 |
| 2016-01-05 | -0.092 |
| 2016-01-06 | -0.151 |
| 2016-01-07 | -0.156 |
| 2016-01-08 | -0.18 |
| 2016-01-11 | -0.188 |
| 2016-01-12 | -0.204 |
| 2016-01-13 | -0.183 |
| 2016-01-14 | -0.218 |
| 2016-01-15 | -0.211 |
| 2016-01-18 | -0.222 |
| 2016-01-19 | -0.19 |
| 2016-01-20 | -0.193 |
| 2016-01-21 | -0.161 |
| 2016-01-22 | -0.165 |
| 2016-01-25 | -0.144 |
| 2016-01-26 | -0.197 |
| 2016-01-27 | -0.193 |
| 2016-01-28 | -0.237 |
| 2016-01-29 | -0.275 |
| 2016-02-01 | -0.28 |
| 2016-02-02 | -0.274 |
| 2016-02-03 | -0.264 |
| 2016-02-04 | -0.244 |
| 2016-02-05 | -0.233 |
| 2016-02-08 | -0.2 |
| 2016-02-09 | -0.176 |
| 2016-02-10 | -0.182 |
| 2016-02-11 | -0.241 |
| 2016-02-12 | -0.241 |
| 2016-02-15 | -0.231 |
| 2016-02-16 | -0.219 |
| 2016-02-17 | -0.199 |
| 2016-02-18 | -0.227 |
| 2016-02-19 | -0.233 |
| 2016-02-22 | -0.244 |
| 2016-02-23 | -0.255 |
| 2016-02-24 | -0.273 |
| 2016-02-25 | -0.232 |
| 2016-02-26 | -0.224 |
| 2016-02-29 | -0.211 |
| 2016-03-01 | -0.194 |
| 2016-03-02 | -0.177 |
| 2016-03-03 | -0.177 |
| 2016-03-04 | -0.198 |
| 2016-03-07 | -0.207 |
| 2016-03-08 | -0.214 |
| 2016-03-09 | -0.181 |
| 2016-03-10 | -0.186 |
| 2016-03-11 | -0.167 |
| 2016-03-14 | -0.155 |
| 2016-03-15 | -0.145 |
| 2016-03-16 | -0.094 |
| 2016-03-17 | -0.085 |
| 2016-03-18 | -0.038 |
| 2016-03-21 | -0.026 |
| 2016-03-22 | -0.022 |
| 2016-03-23 | -0.041 |
| 2016-03-24 | -0.06 |
| 2016-03-25 | -0.06 |
| 2016-03-28 | -0.062 |
| 2016-03-29 | -0.075 |
| 2016-03-30 | -0.078 |
| 2016-03-31 | -0.038 |
| 2016-04-01 | -0.039 |
| 2016-04-04 | -0.025 |
| 2016-04-05 | -0.034 |
| 2016-04-06 | -0.011 |
| 2016-04-07 | 0.013 |
| 2016-04-08 | 0.018 |
| 2016-04-11 | -0.01 |
| 2016-04-12 | -0.033 |
| 2016-04-13 | -0.007 |
| 2016-04-14 | -0.057 |
| 2016-04-15 | -0.079 |
| 2016-04-18 | -0.098 |
| 2016-04-19 | -0.069 |
| 2016-04-20 | -0.066 |
| 2016-04-21 | -0.073 |
| 2016-04-22 | -0.121 |
| 2016-04-25 | -0.174 |
| 2016-04-26 | -0.2 |
| 2016-04-27 | -0.202 |
| 2016-04-28 | -0.19 |
| 2016-04-29 | -0.186 |
| 2016-05-02 | -0.201 |
| 2016-05-03 | -0.215 |
| 2016-05-04 | -0.204 |
| 2016-05-05 | -0.196 |
| 2016-05-06 | -0.198 |
| 2016-05-09 | -0.166 |
| 2016-05-10 | -0.174 |
| 2016-05-11 | -0.16 |
| 2016-05-12 | -0.177 |
| 2016-05-13 | -0.169 |
| 2016-05-16 | -0.144 |
| 2016-05-17 | -0.152 |
| 2016-05-18 | -0.147 |
| 2016-05-19 | -0.111 |
| 2016-05-20 | -0.104 |
| 2016-05-23 | -0.073 |
| 2016-05-24 | -0.079 |
| 2016-05-25 | -0.121 |
| 2016-05-26 | -0.159 |
| 2016-05-27 | -0.148 |
| 2016-05-30 | -0.156 |
| 2016-05-31 | -0.149 |
| 2016-06-01 | -0.137 |
| 2016-06-02 | -0.169 |
| 2016-06-03 | -0.173 |
| 2016-06-06 | -0.175 |
| 2016-06-07 | -0.134 |
| 2016-06-08 | -0.188 |
| 2016-06-09 | -0.196 |
| 2016-06-10 | -0.21 |
| 2016-06-13 | -0.202 |
| 2016-06-14 | -0.217 |
| 2016-06-15 | -0.206 |
| 2016-06-16 | -0.224 |
| 2016-06-17 | -0.227 |
| 2016-06-20 | -0.225 |
| 2016-06-21 | -0.175 |
| 2016-06-22 | -0.174 |
| 2016-06-23 | -0.15 |
| 2016-06-24 | -0.182 |
| 2016-06-27 | -0.182 |
| 2016-06-28 | -0.197 |
| 2016-06-29 | -0.185 |
| 2016-06-30 | -0.236 |
| 2016-07-01 | -0.25 |
| 2016-07-04 | -0.229 |
| 2016-07-05 | -0.224 |
| 2016-07-06 | -0.184 |
| 2016-07-07 | -0.191 |
| 2016-07-08 | -0.183 |
| 2016-07-11 | -0.173 |
| 2016-07-12 | -0.204 |
| 2016-07-13 | -0.211 |
| 2016-07-14 | -0.242 |
| 2016-07-15 | -0.269 |
| 2016-07-18 | -0.316 |
| 2016-07-19 | -0.327 |
| 2016-07-20 | -0.341 |
| 2016-07-21 | -0.313 |
| 2016-07-22 | -0.283 |
| 2016-07-25 | -0.247 |
| 2016-07-26 | -0.246 |
| 2016-07-27 | -0.234 |
| 2016-07-28 | -0.234 |
| 2016-07-29 | -0.256 |
| 2016-08-01 | -0.247 |
| 2016-08-02 | -0.268 |
| 2016-08-03 | -0.28 |
| 2016-08-04 | -0.236 |
| 2016-08-05 | -0.225 |
| 2016-08-08 | -0.248 |
| 2016-08-09 | -0.189 |
| 2016-08-10 | -0.151 |
| 2016-08-11 | -0.134 |
| 2016-08-12 | -0.192 |
| 2016-08-15 | -0.192 |
| 2016-08-16 | -0.197 |
| 2016-08-17 | -0.21 |
| 2016-08-18 | -0.233 |
| 2016-08-19 | -0.231 |
| 2016-08-22 | -0.23 |
| 2016-08-23 | -0.249 |
| 2016-08-24 | -0.205 |
| 2016-08-25 | -0.205 |
| 2016-08-26 | -0.216 |
| 2016-08-29 | -0.236 |
| 2016-08-30 | -0.24 |
| 2016-08-31 | -0.246 |
| 2016-09-01 | -0.224 |
| 2016-09-02 | -0.235 |
| 2016-09-05 | -0.214 |
| 2016-09-06 | -0.231 |
| 2016-09-07 | -0.225 |
| 2016-09-08 | -0.203 |
| 2016-09-09 | -0.166 |
| 2016-09-12 | -0.174 |
| 2016-09-13 | -0.138 |
| 2016-09-14 | -0.162 |
| 2016-09-15 | -0.204 |
| 2016-09-16 | -0.176 |
| 2016-09-19 | -0.176 |
| 2016-09-20 | -0.164 |
| 2016-09-21 | -0.186 |
| 2016-09-22 | -0.174 |
| 2016-09-23 | -0.181 |
| 2016-09-26 | -0.181 |
| 2016-09-27 | -0.167 |
| 2016-09-28 | -0.193 |
| 2016-09-29 | -0.194 |
| 2016-09-30 | -0.197 |
| 2016-10-03 | -0.163 |
| 2016-10-04 | -0.141 |
| 2016-10-05 | -0.163 |
| 2016-10-06 | -0.154 |
| 2016-10-07 | -0.193 |
| 2016-10-10 | -0.193 |
| 2016-10-11 | -0.235 |
| 2016-10-12 | -0.225 |
| 2016-10-13 | -0.254 |
| 2016-10-14 | -0.227 |
| 2016-10-17 | -0.227 |
| 2016-10-18 | -0.227 |
| 2016-10-19 | -0.243 |
| 2016-10-20 | -0.233 |
| 2016-10-21 | -0.257 |
| 2016-10-24 | -0.257 |
| 2016-10-25 | -0.226 |
| 2016-10-26 | -0.255 |
| 2016-10-27 | -0.256 |
| 2016-10-28 | -0.235 |
| 2016-10-31 | -0.235 |
| 2016-11-01 | -0.235 |
| 2016-11-02 | -0.23 |
| 2016-11-03 | -0.248 |
| 2016-11-04 | -0.213 |
| 2016-11-07 | -0.219 |
| 2016-11-08 | -0.257 |
| 2016-11-09 | -0.216 |
| 2016-11-10 | -0.216 |
| 2016-11-11 | -0.161 |
| 2016-11-14 | -0.193 |
| 2016-11-15 | -0.202 |
| 2016-11-16 | -0.178 |
| 2016-11-17 | -0.184 |
| 2016-11-18 | -0.149 |
| 2016-11-21 | -0.148 |
| 2016-11-22 | -0.234 |
| 2016-11-23 | -0.236 |
| 2016-11-24 | -0.2 |
| 2016-11-25 | -0.176 |
| 2016-11-28 | -0.176 |
| 2016-11-29 | -0.233 |
| 2016-11-30 | -0.215 |
| 2016-12-01 | -0.153 |
| 2016-12-02 | -0.155 |
| 2016-12-05 | -0.178 |
| 2016-12-06 | -0.234 |
| 2016-12-07 | -0.262 |
| 2016-12-08 | -0.262 |
| 2016-12-09 | -0.262 |
| 2016-12-12 | -0.292 |
| 2016-12-13 | -0.292 |
| 2016-12-14 | -0.275 |
| 2016-12-15 | -0.238 |
| 2016-12-16 | -0.236 |
| 2016-12-19 | -0.238 |
| 2016-12-20 | -0.223 |
| 2016-12-21 | -0.298 |
| 2016-12-22 | -0.284 |
| 2016-12-23 | -0.258 |
| 2016-12-26 | -0.276 |
| 2016-12-27 | -0.275 |
| 2016-12-28 | -0.292 |
| 2016-12-29 | -0.282 |
| 2016-12-30 | -0.28 |
| 2017-01-02 | -0.28 |
| 2017-01-03 | -0.263 |
| 2017-01-04 | -0.244 |
| 2017-01-05 | -0.195 |
| 2017-01-06 | -0.192 |
| 2017-01-09 | -0.157 |
| 2017-01-10 | -0.158 |
| 2017-01-11 | -0.158 |
| 2017-01-12 | -0.161 |
| 2017-01-13 | -0.145 |
| 2017-01-16 | -0.171 |
| 2017-01-17 | -0.175 |
| 2017-01-18 | -0.175 |
| 2017-01-19 | -0.162 |
| 2017-01-20 | -0.178 |
| 2017-01-23 | -0.172 |
| 2017-01-24 | -0.165 |
| 2017-01-25 | -0.125 |
| 2017-01-26 | -0.135 |
| 2017-01-27 | -0.124 |
| 2017-01-30 | -0.149 |
| 2017-01-31 | -0.191 |
| 2017-02-01 | -0.198 |
| 2017-02-02 | -0.225 |
| 2017-02-03 | -0.181 |
| 2017-02-06 | -0.169 |
| 2017-02-07 | -0.134 |
| 2017-02-08 | -0.159 |
| 2017-02-09 | -0.165 |
| 2017-02-10 | -0.163 |
| 2017-02-13 | -0.165 |
| 2017-02-14 | -0.158 |
| 2017-02-15 | -0.154 |
| 2017-02-16 | -0.156 |
| 2017-02-17 | -0.171 |
| 2017-02-20 | -0.17 |
| 2017-02-21 | -0.19 |
| 2017-02-22 | -0.183 |
| 2017-02-23 | -0.21 |
| 2017-02-24 | -0.244 |
| 2017-02-27 | -0.242 |
| 2017-02-28 | -0.195 |
| 2017-03-01 | -0.174 |
| 2017-03-02 | -0.165 |
| 2017-03-03 | -0.175 |
| 2017-03-06 | -0.125 |
| 2017-03-07 | -0.148 |
| 2017-03-08 | -0.149 |
| 2017-03-09 | -0.136 |
| 2017-03-10 | -0.118 |
| 2017-03-13 | -0.098 |
| 2017-03-14 | -0.155 |
| 2017-03-15 | -0.17 |
| 2017-03-16 | -0.19 |
| 2017-03-17 | -0.168 |
| 2017-03-20 | -0.188 |
| 2017-03-21 | -0.215 |
| 2017-03-22 | -0.257 |
| 2017-03-23 | -0.241 |
| 2017-03-24 | -0.231 |
| 2017-03-27 | -0.245 |
| 2017-03-28 | -0.253 |
| 2017-03-29 | -0.253 |
| 2017-03-30 | -0.242 |
| 2017-03-31 | -0.185 |
| 2017-04-03 | -0.173 |
| 2017-04-04 | -0.201 |
| 2017-04-05 | -0.203 |
| 2017-04-06 | -0.191 |
| 2017-04-07 | -0.178 |
| 2017-04-10 | -0.176 |
| 2017-04-11 | -0.229 |
| 2017-04-12 | -0.251 |
| 2017-04-13 | -0.262 |
| 2017-04-14 | -0.262 |
| 2017-04-17 | -0.223 |
| 2017-04-18 | -0.23 |
| 2017-04-19 | -0.23 |
| 2017-04-20 | -0.212 |
| 2017-04-21 | -0.224 |
| 2017-04-24 | -0.241 |
| 2017-04-25 | -0.228 |
| 2017-04-26 | -0.184 |
| 2017-04-27 | -0.207 |
| 2017-04-28 | -0.184 |
| 2017-05-01 | -0.184 |
| 2017-05-02 | -0.195 |
| 2017-05-03 | -0.17 |
| 2017-05-04 | -0.169 |
| 2017-05-05 | -0.139 |
| 2017-05-08 | -0.126 |
| 2017-05-09 | -0.125 |
| 2017-05-10 | -0.141 |
| 2017-05-11 | -0.104 |
| 2017-05-12 | -0.098 |
| 2017-05-15 | -0.102 |
| 2017-05-16 | -0.108 |
| 2017-05-17 | -0.13 |
| 2017-05-18 | -0.142 |
| 2017-05-19 | -0.136 |
| 2017-05-22 | -0.121 |
| 2017-05-23 | -0.144 |
| 2017-05-24 | -0.112 |
| 2017-05-25 | -0.129 |
| 2017-05-26 | -0.119 |
| 2017-05-29 | -0.124 |
| 2017-05-30 | -0.123 |
| 2017-05-31 | -0.163 |
| 2017-06-01 | -0.188 |
| 2017-06-02 | -0.239 |
| 2017-06-05 | -0.222 |
| 2017-06-06 | -0.233 |
| 2017-06-07 | -0.216 |
| 2017-06-08 | -0.191 |
| 2017-06-09 | -0.19 |
| 2017-06-12 | -0.183 |
| 2017-06-13 | -0.194 |
| 2017-06-14 | -0.239 |
| 2017-06-15 | -0.204 |
| 2017-06-16 | -0.218 |
| 2017-06-19 | -0.221 |
| 2017-06-20 | -0.272 |
| 2017-06-21 | -0.275 |
| 2017-06-22 | -0.259 |
| 2017-06-23 | -0.272 |
| 2017-06-26 | -0.272 |
| 2017-06-27 | -0.272 |
| 2017-06-28 | -0.272 |
| 2017-06-29 | -0.246 |
| 2017-06-30 | -0.23 |
| 2017-07-03 | -0.23 |
| 2017-07-04 | -0.227 |
| 2017-07-05 | -0.226 |
| 2017-07-06 | -0.265 |
| 2017-07-07 | -0.287 |
| 2017-07-10 | -0.301 |
| 2017-07-11 | -0.307 |
| 2017-07-12 | -0.28 |
| 2017-07-13 | -0.295 |
| 2017-07-14 | -0.284 |
| 2017-07-17 | -0.309 |
| 2017-07-18 | -0.293 |
| 2017-07-19 | -0.283 |
| 2017-07-20 | -0.301 |
| 2017-07-21 | -0.31 |
| 2017-07-24 | -0.325 |
| 2017-07-25 | -0.317 |
| 2017-07-26 | -0.286 |
| 2017-07-27 | -0.25 |
| 2017-07-28 | -0.231 |
| 2017-07-31 | -0.209 |
| 2017-08-01 | -0.228 |
| 2017-08-02 | -0.242 |
| 2017-08-03 | -0.254 |
| 2017-08-04 | -0.262 |
| 2017-08-07 | -0.272 |
| 2017-08-08 | -0.238 |
| 2017-08-09 | -0.262 |
| 2017-08-10 | -0.278 |
| 2017-08-11 | -0.266 |
| 2017-08-14 | -0.289 |
| 2017-08-15 | -0.289 |
| 2017-08-16 | -0.282 |
| 2017-08-17 | -0.302 |
| 2017-08-18 | -0.277 |
| 2017-08-21 | -0.299 |
| 2017-08-22 | -0.302 |
| 2017-08-23 | -0.27 |
| 2017-08-24 | -0.228 |
| 2017-08-25 | -0.24 |
| 2017-08-28 | -0.24 |
| 2017-08-29 | -0.247 |
| 2017-08-30 | -0.229 |
| 2017-08-31 | -0.225 |
| 2017-09-01 | -0.219 |
| 2017-09-04 | -0.21 |
| 2017-09-05 | -0.21 |
| 2017-09-06 | -0.217 |
| 2017-09-07 | -0.271 |
| 2017-09-08 | -0.266 |
| 2017-09-11 | -0.246 |
| 2017-09-12 | -0.213 |
| 2017-09-13 | -0.208 |
| 2017-09-14 | -0.207 |
| 2017-09-15 | -0.179 |
| 2017-09-18 | -0.179 |
| 2017-09-19 | -0.179 |
| 2017-09-20 | -0.202 |
| 2017-09-21 | -0.193 |
| 2017-09-22 | -0.183 |
| 2017-09-25 | -0.199 |
| 2017-09-26 | -0.193 |
| 2017-09-27 | -0.2 |
| 2017-09-28 | -0.205 |
| 2017-09-29 | -0.181 |
| 2017-10-02 | -0.201 |
| 2017-10-03 | -0.213 |
| 2017-10-04 | -0.194 |
| 2017-10-05 | -0.189 |
| 2017-10-06 | -0.212 |
| 2017-10-09 | -0.212 |
| 2017-10-10 | -0.253 |
| 2017-10-11 | -0.259 |
| 2017-10-12 | -0.264 |
| 2017-10-13 | -0.296 |
| 2017-10-16 | -0.315 |
| 2017-10-17 | -0.295 |
| 2017-10-18 | -0.286 |
| 2017-10-19 | -0.28 |
| 2017-10-20 | -0.242 |
| 2017-10-23 | -0.259 |
| 2017-10-24 | -0.258 |
| 2017-10-25 | -0.268 |
| 2017-10-26 | -0.284 |
| 2017-10-27 | -0.284 |
| 2017-10-30 | -0.332 |
| 2017-10-31 | -0.341 |
| 2017-11-01 | -0.341 |
| 2017-11-02 | -0.325 |
| 2017-11-03 | -0.314 |
| 2017-11-06 | -0.294 |
| 2017-11-07 | -0.287 |
| 2017-11-08 | -0.252 |
| 2017-11-09 | -0.272 |
| 2017-11-10 | -0.302 |
| 2017-11-13 | -0.326 |
| 2017-11-14 | -0.305 |
| 2017-11-15 | -0.315 |
| 2017-11-16 | -0.314 |
| 2017-11-17 | -0.28 |
| 2017-11-20 | -0.283 |
| 2017-11-21 | -0.299 |
| 2017-11-22 | -0.297 |
| 2017-11-23 | -0.311 |
| 2017-11-24 | -0.301 |
| 2017-11-27 | -0.314 |
| 2017-11-28 | -0.318 |
| 2017-11-29 | -0.317 |
| 2017-11-30 | -0.34 |
| 2017-12-01 | -0.363 |
| 2017-12-04 | -0.342 |
| 2017-12-05 | -0.338 |
| 2017-12-06 | -0.306 |
| 2017-12-07 | -0.307 |
| 2017-12-08 | -0.307 |
| 2017-12-11 | -0.282 |
| 2017-12-12 | -0.305 |
| 2017-12-13 | -0.325 |
| 2017-12-14 | -0.377 |
| 2017-12-15 | -0.397 |
| 2017-12-18 | -0.399 |
| 2017-12-19 | -0.387 |
| 2017-12-20 | -0.352 |
| 2017-12-21 | -0.348 |
| 2017-12-22 | -0.333 |
| 2017-12-25 | -0.333 |
| 2017-12-26 | -0.345 |
| 2017-12-27 | -0.361 |
| 2017-12-28 | -0.345 |
| 2017-12-29 | -0.365 |
| 2018-01-01 | -0.365 |
| 2018-01-02 | -0.372 |
| 2018-01-03 | -0.35 |
| 2018-01-04 | -0.305 |
| 2018-01-05 | -0.283 |
| 2018-01-08 | -0.308 |
| 2018-01-09 | -0.34 |
| 2018-01-10 | -0.345 |
| 2018-01-11 | -0.34 |
| 2018-01-12 | -0.355 |
| 2018-01-15 | -0.363 |
| 2018-01-16 | -0.363 |
| 2018-01-17 | -0.408 |
| 2018-01-18 | -0.397 |
| 2018-01-19 | -0.406 |
| 2018-01-22 | -0.432 |
| 2018-01-23 | -0.426 |
| 2018-01-24 | -0.439 |
| 2018-01-25 | -0.436 |
| 2018-01-26 | -0.442 |
| 2018-01-29 | -0.416 |
| 2018-01-30 | -0.422 |
| 2018-01-31 | -0.403 |
| 2018-02-01 | -0.349 |
| 2018-02-02 | -0.331 |
| 2018-02-05 | -0.331 |
| 2018-02-06 | -0.329 |
| 2018-02-07 | -0.341 |
| 2018-02-08 | -0.319 |
| 2018-02-09 | -0.28 |
| 2018-02-12 | -0.271 |
| 2018-02-13 | -0.309 |
| 2018-02-14 | -0.296 |
| 2018-02-15 | -0.282 |
| 2018-02-16 | -0.291 |
| 2018-02-19 | -0.297 |
| 2018-02-20 | -0.301 |
| 2018-02-21 | -0.294 |
| 2018-02-22 | -0.36 |
| 2018-02-23 | -0.347 |
| 2018-02-26 | -0.356 |
| 2018-02-27 | -0.356 |
| 2018-02-28 | -0.34 |
| 2018-03-01 | -0.323 |
| 2018-03-02 | -0.312 |
| 2018-03-05 | -0.278 |
| 2018-03-06 | -0.272 |
| 2018-03-07 | -0.274 |
| 2018-03-08 | -0.282 |
| 2018-03-09 | -0.295 |
| 2018-03-12 | -0.289 |
| 2018-03-13 | -0.291 |
| 2018-03-14 | -0.297 |
| 2018-03-15 | -0.285 |
| 2018-03-16 | -0.293 |
| 2018-03-19 | -0.307 |
| 2018-03-20 | -0.33 |
| 2018-03-21 | -0.335 |
| 2018-03-22 | -0.337 |
| 2018-03-23 | -0.302 |
| 2018-03-26 | -0.312 |
| 2018-03-27 | -0.294 |
| 2018-03-28 | -0.279 |
| 2018-03-29 | -0.265 |
| 2018-03-30 | -0.265 |
| 2018-04-02 | -0.238 |
| 2018-04-03 | -0.274 |
| 2018-04-04 | -0.283 |
| 2018-04-05 | -0.267 |
| 2018-04-06 | -0.279 |
| 2018-04-09 | -0.316 |
| 2018-04-10 | -0.305 |
| 2018-04-11 | -0.322 |
| 2018-04-12 | -0.33 |
| 2018-04-13 | -0.319 |
| 2018-04-16 | -0.359 |
| 2018-04-17 | -0.374 |
| 2018-04-18 | -0.348 |
| 2018-04-19 | -0.35 |
| 2018-04-20 | -0.337 |
| 2018-04-23 | -0.325 |
| 2018-04-24 | -0.338 |
| 2018-04-25 | -0.314 |
| 2018-04-26 | -0.326 |
| 2018-04-27 | -0.312 |
| 2018-04-30 | -0.345 |
| 2018-05-01 | -0.345 |
| 2018-05-02 | -0.34 |
| 2018-05-03 | -0.33 |
| 2018-05-04 | -0.326 |
| 2018-05-07 | -0.304 |
| 2018-05-08 | -0.293 |
| 2018-05-09 | -0.288 |
| 2018-05-10 | -0.335 |
| 2018-05-11 | -0.323 |
| 2018-05-14 | -0.33 |
| 2018-05-15 | -0.338 |
| 2018-05-16 | -0.32 |
| 2018-05-17 | -0.315 |
| 2018-05-18 | -0.314 |
| 2018-05-21 | -0.316 |
| 2018-05-22 | -0.307 |
| 2018-05-23 | -0.314 |
| 2018-05-24 | -0.3 |
| 2018-05-25 | -0.308 |
| 2018-05-28 | -0.291 |
| 2018-05-29 | -0.254 |
| 2018-05-30 | -0.247 |
| 2018-05-31 | -0.233 |
| 2018-06-01 | -0.229 |
| 2018-06-04 | -0.234 |
| 2018-06-05 | -0.234 |
| 2018-06-06 | -0.235 |
| 2018-06-07 | -0.248 |
| 2018-06-08 | -0.255 |
| 2018-06-11 | -0.248 |
| 2018-06-12 | -0.265 |
| 2018-06-13 | -0.297 |
| 2018-06-14 | -0.278 |
| 2018-06-15 | -0.271 |
| 2018-06-18 | -0.251 |
| 2018-06-19 | -0.28 |
| 2018-06-20 | -0.292 |
| 2018-06-21 | -0.26 |
| 2018-06-22 | -0.27 |
| 2018-06-25 | -0.268 |
| 2018-06-26 | -0.284 |
| 2018-06-27 | -0.282 |
| 2018-06-28 | -0.264 |
| 2018-06-29 | -0.261 |
| 2018-07-02 | -0.262 |
| 2018-07-03 | -0.257 |
| 2018-07-04 | -0.248 |
| 2018-07-05 | -0.265 |
| 2018-07-06 | -0.278 |
| 2018-07-09 | -0.274 |
| 2018-07-10 | -0.24 |
| 2018-07-11 | -0.227 |
| 2018-07-12 | -0.235 |
| 2018-07-13 | -0.238 |
| 2018-07-16 | -0.238 |
| 2018-07-17 | -0.251 |
| 2018-07-18 | -0.258 |
| 2018-07-19 | -0.263 |
| 2018-07-20 | -0.229 |
| 2018-07-23 | -0.199 |
| 2018-07-24 | -0.222 |
| 2018-07-25 | -0.232 |
| 2018-07-26 | -0.237 |
| 2018-07-27 | -0.216 |
| 2018-07-30 | -0.214 |
| 2018-07-31 | -0.21 |
| 2018-08-01 | -0.223 |
| 2018-08-02 | -0.22 |
| 2018-08-03 | -0.235 |
| 2018-08-06 | -0.219 |
| 2018-08-07 | -0.208 |
| 2018-08-08 | -0.223 |
| 2018-08-09 | -0.233 |
| 2018-08-10 | -0.219 |
| 2018-08-13 | -0.217 |
| 2018-08-14 | -0.195 |
| 2018-08-15 | -0.196 |
| 2018-08-16 | -0.198 |
| 2018-08-17 | -0.213 |
| 2018-08-20 | -0.241 |
| 2018-08-21 | -0.246 |
| 2018-08-22 | -0.252 |
| 2018-08-23 | -0.241 |
| 2018-08-24 | -0.222 |
| 2018-08-27 | -0.233 |
| 2018-08-28 | -0.254 |
| 2018-08-29 | -0.225 |
| 2018-08-30 | -0.197 |
| 2018-08-31 | -0.201 |
| 2018-09-03 | -0.207 |
| 2018-09-04 | -0.169 |
| 2018-09-05 | -0.152 |
| 2018-09-06 | -0.123 |
| 2018-09-07 | -0.124 |
| 2018-09-10 | -0.123 |
| 2018-09-11 | -0.138 |
| 2018-09-12 | -0.121 |
| 2018-09-13 | -0.123 |
| 2018-09-14 | -0.133 |
| 2018-09-17 | -0.135 |
| 2018-09-18 | -0.136 |
| 2018-09-19 | -0.136 |
| 2018-09-20 | -0.136 |
| 2018-09-21 | -0.165 |
| 2018-09-24 | -0.178 |
| 2018-09-25 | -0.184 |
| 2018-09-26 | -0.159 |
| 2018-09-27 | -0.148 |
| 2018-09-28 | -0.155 |
| 2018-10-01 | -0.138 |
| 2018-10-02 | -0.176 |
| 2018-10-03 | -0.182 |
| 2018-10-04 | -0.176 |
| 2018-10-05 | -0.191 |
| 2018-10-08 | -0.161 |
| 2018-10-09 | -0.135 |
| 2018-10-10 | -0.149 |
| 2018-10-11 | -0.156 |
| 2018-10-12 | -0.211 |
| 2018-10-15 | -0.213 |
| 2018-10-16 | -0.219 |
| 2018-10-17 | -0.207 |
| 2018-10-18 | -0.198 |
| 2018-10-19 | -0.183 |
| 2018-10-22 | -0.188 |
| 2018-10-23 | -0.167 |
| 2018-10-24 | -0.176 |
| 2018-10-25 | -0.162 |
| 2018-10-26 | -0.162 |
| 2018-10-29 | -0.166 |
| 2018-10-30 | -0.158 |
| 2018-10-31 | -0.172 |
| 2018-11-01 | -0.173 |
| 2018-11-02 | -0.174 |
| 2018-11-05 | -0.152 |
| 2018-11-06 | -0.168 |
| 2018-11-07 | -0.173 |
| 2018-11-08 | -0.151 |
| 2018-11-09 | -0.156 |
| 2018-11-12 | -0.158 |
| 2018-11-13 | -0.166 |
| 2018-11-14 | -0.183 |
| 2018-11-15 | -0.179 |
| 2018-11-16 | -0.194 |
| 2018-11-19 | -0.196 |
| 2018-11-20 | -0.214 |
| 2018-11-21 | -0.21 |
| 2018-11-22 | -0.204 |
| 2018-11-23 | -0.209 |
| 2018-11-26 | -0.198 |
| 2018-11-27 | -0.247 |
| 2018-11-28 | -0.278 |
| 2018-11-29 | -0.279 |
| 2018-11-30 | -0.279 |
| 2018-12-03 | -0.242 |
| 2018-12-04 | -0.26 |
| 2018-12-05 | -0.237 |
| 2018-12-06 | -0.242 |
| 2018-12-07 | -0.231 |
| 2018-12-10 | -0.208 |
| 2018-12-11 | -0.21 |
| 2018-12-12 | -0.21 |
| 2018-12-13 | -0.275 |
| 2018-12-14 | -0.321 |
| 2018-12-17 | -0.295 |
| 2018-12-18 | -0.317 |
| 2018-12-19 | -0.28 |
| 2018-12-20 | -0.304 |
| 2018-12-21 | -0.303 |
| 2018-12-24 | -0.303 |
| 2018-12-25 | -0.303 |
| 2018-12-26 | -0.316 |
| 2018-12-27 | -0.302 |
| 2018-12-28 | -0.299 |
| 2018-12-31 | -0.301 |
| 2019-01-01 | -0.302 |
| 2019-01-02 | -0.304 |
| 2019-01-03 | -0.269 |
| 2019-01-04 | -0.282 |
| 2019-01-07 | -0.276 |
| 2019-01-08 | -0.262 |
| 2019-01-09 | -0.243 |
| 2019-01-10 | -0.223 |
| 2019-01-11 | -0.2 |
| 2019-01-14 | -0.198 |
| 2019-01-15 | -0.176 |
| 2019-01-16 | -0.16 |
| 2019-01-17 | -0.145 |
| 2019-01-18 | -0.159 |
| 2019-01-21 | -0.183 |
| 2019-01-22 | -0.256 |
| 2019-01-23 | -0.255 |
| 2019-01-24 | -0.251 |
| 2019-01-25 | -0.228 |
| 2019-01-28 | -0.204 |
| 2019-01-29 | -0.203 |
| 2019-01-30 | -0.209 |
| 2019-01-31 | -0.221 |
| 2019-02-01 | -0.215 |
| 2019-02-04 | -0.178 |
| 2019-02-05 | -0.165 |
| 2019-02-06 | -0.198 |
| 2019-02-07 | -0.213 |
| 2019-02-08 | -0.276 |
| 2019-02-11 | -0.299 |
| 2019-02-12 | -0.304 |
| 2019-02-13 | -0.34 |
| 2019-02-14 | -0.336 |
| 2019-02-15 | -0.338 |
| 2019-02-18 | -0.324 |
| 2019-02-19 | -0.316 |
| 2019-02-20 | -0.317 |
| 2019-02-21 | -0.293 |
| 2019-02-22 | -0.29 |
| 2019-02-25 | -0.27 |
| 2019-02-26 | -0.26 |
| 2019-02-27 | -0.26 |
| 2019-02-28 | -0.23 |
| 2019-03-01 | -0.24 |
| 2019-03-04 | -0.249 |
| 2019-03-05 | -0.258 |
| 2019-03-06 | -0.279 |
| 2019-03-07 | -0.306 |
| 2019-03-08 | -0.329 |
| 2019-03-11 | -0.317 |
| 2019-03-12 | -0.327 |
| 2019-03-13 | -0.338 |
| 2019-03-14 | -0.335 |
| 2019-03-15 | -0.333 |
| 2019-03-18 | -0.329 |
| 2019-03-19 | -0.341 |
| 2019-03-20 | -0.332 |
| 2019-03-21 | -0.322 |
| 2019-03-22 | -0.317 |
| 2019-03-25 | -0.274 |
| 2019-03-26 | -0.301 |
| 2019-03-27 | -0.318 |
| 2019-03-28 | -0.326 |
| 2019-03-29 | -0.334 |
| 2019-04-01 | -0.345 |
| 2019-04-02 | -0.346 |
| 2019-04-03 | -0.35 |
| 2019-04-04 | -0.34 |
| 2019-04-05 | -0.335 |
| 2019-04-08 | -0.286 |
| 2019-04-09 | -0.303 |
| 2019-04-10 | -0.299 |
| 2019-04-11 | -0.297 |
| 2019-04-12 | -0.278 |
| 2019-04-15 | -0.303 |
| 2019-04-16 | -0.302 |
| 2019-04-17 | -0.308 |
| 2019-04-18 | -0.295 |
| 2019-04-19 | -0.295 |
| 2019-04-22 | -0.292 |
| 2019-04-23 | -0.296 |
| 2019-04-24 | -0.301 |
| 2019-04-25 | -0.318 |
| 2019-04-26 | -0.31 |
| 2019-04-29 | -0.323 |
| 2019-04-30 | -0.333 |
| 2019-05-01 | -0.333 |
| 2019-05-02 | -0.319 |
| 2019-05-03 | -0.318 |
| 2019-05-06 | -0.329 |
| 2019-05-07 | -0.319 |
| 2019-05-08 | -0.33 |
| 2019-05-09 | -0.332 |
| 2019-05-10 | -0.326 |
| 2019-05-13 | -0.346 |
| 2019-05-14 | -0.349 |
| 2019-05-15 | -0.333 |
| 2019-05-16 | -0.34 |
| 2019-05-17 | -0.348 |
| 2019-05-20 | -0.353 |
| 2019-05-21 | -0.354 |
| 2019-05-22 | -0.355 |
| 2019-05-23 | -0.355 |
| 2019-05-24 | -0.381 |
| 2019-05-27 | -0.348 |
| 2019-05-28 | -0.377 |
| 2019-05-29 | -0.435 |
| 2019-05-30 | -0.422 |
| 2019-05-31 | -0.429 |
| 2019-06-03 | -0.41 |
| 2019-06-04 | -0.358 |
| 2019-06-05 | -0.343 |
| 2019-06-06 | -0.315 |
| 2019-06-07 | -0.31 |
| 2019-06-10 | -0.343 |
| 2019-06-11 | -0.342 |
| 2019-06-12 | -0.344 |
| 2019-06-13 | -0.339 |
| 2019-06-14 | -0.344 |
| 2019-06-17 | -0.353 |
| 2019-06-18 | -0.372 |
| 2019-06-19 | -0.387 |
| 2019-06-20 | -0.425 |
| 2019-06-21 | -0.425 |
| 2019-06-24 | -0.451 |
| 2019-06-25 | -0.487 |
| 2019-06-26 | -0.465 |
| 2019-06-27 | -0.455 |
| 2019-06-28 | -0.442 |
| 2019-07-01 | -0.452 |
| 2019-07-02 | -0.44 |
| 2019-07-03 | -0.46 |
| 2019-07-04 | -0.461 |
| 2019-07-05 | -0.459 |
| 2019-07-08 | -0.466 |
| 2019-07-09 | -0.479 |
| 2019-07-10 | -0.474 |
| 2019-07-11 | -0.458 |
| 2019-07-12 | -0.451 |
| 2019-07-15 | -0.442 |
| 2019-07-16 | -0.442 |
| 2019-07-17 | -0.449 |
| 2019-07-18 | -0.458 |
| 2019-07-19 | -0.451 |
| 2019-07-22 | -0.461 |
| 2019-07-23 | -0.47 |
| 2019-07-24 | -0.477 |
| 2019-07-25 | -0.526 |
| 2019-07-26 | -0.511 |
| 2019-07-29 | -0.481 |
| 2019-07-30 | -0.448 |
| 2019-07-31 | -0.433 |
| 2019-08-01 | -0.442 |
| 2019-08-02 | -0.446 |
| 2019-08-05 | -0.452 |
| 2019-08-06 | -0.46 |
| 2019-08-07 | -0.476 |
| 2019-08-08 | -0.47 |
| 2019-08-09 | -0.453 |
| 2019-08-12 | -0.451 |
| 2019-08-13 | -0.46 |
| 2019-08-14 | -0.484 |
| 2019-08-15 | -0.484 |
| 2019-08-16 | -0.476 |
| 2019-08-19 | -0.469 |
| 2019-08-20 | -0.462 |
| 2019-08-21 | -0.467 |
| 2019-08-22 | -0.48 |
| 2019-08-23 | -0.494 |
| 2019-08-26 | -0.49 |
| 2019-08-27 | -0.501 |
| 2019-08-28 | -0.5 |
| 2019-08-29 | -0.493 |
| 2019-08-30 | -0.478 |
| 2019-09-02 | -0.475 |
| 2019-09-03 | -0.489 |
| 2019-09-04 | -0.449 |
| 2019-09-05 | -0.448 |
| 2019-09-06 | -0.45 |
| 2019-09-09 | -0.481 |
| 2019-09-10 | -0.495 |
| 2019-09-11 | -0.495 |
| 2019-09-12 | -0.474 |
| 2019-09-13 | -0.442 |
| 2019-09-16 | -0.427 |
| 2019-09-17 | -0.415 |
| 2019-09-18 | -0.415 |
| 2019-09-19 | -0.415 |
| 2019-09-20 | -0.415 |
| 2019-09-23 | -0.417 |
| 2019-09-24 | -0.405 |
| 2019-09-25 | -0.401 |
| 2019-09-26 | -0.378 |
| 2019-09-27 | -0.356 |
| 2019-09-30 | -0.33 |
| 2019-10-01 | -0.322 |
| 2019-10-02 | -0.327 |
| 2019-10-03 | -0.333 |
| 2019-10-04 | -0.329 |
| 2019-10-07 | -0.304 |
| 2019-10-08 | -0.357 |
| 2019-10-09 | -0.343 |
| 2019-10-10 | -0.322 |
| 2019-10-11 | -0.282 |
| 2019-10-14 | -0.271 |
| 2019-10-15 | -0.272 |
| 2019-10-16 | -0.303 |
| 2019-10-17 | -0.288 |
| 2019-10-18 | -0.269 |
| 2019-10-21 | -0.298 |
| 2019-10-22 | -0.322 |
| 2019-10-23 | -0.371 |
| 2019-10-24 | -0.356 |
| 2019-10-25 | -0.343 |
| 2019-10-28 | -0.309 |
| 2019-10-29 | -0.27 |
| 2019-10-30 | -0.246 |
| 2019-10-31 | -0.246 |
| 2019-11-01 | -0.246 |
| 2019-11-04 | -0.26 |
| 2019-11-05 | -0.258 |
| 2019-11-06 | -0.295 |
| 2019-11-07 | -0.261 |
| 2019-11-08 | -0.264 |
| 2019-11-11 | -0.299 |
| 2019-11-12 | -0.265 |
| 2019-11-13 | -0.207 |
| 2019-11-14 | -0.208 |
| 2019-11-15 | -0.268 |
| 2019-11-18 | -0.288 |
| 2019-11-19 | -0.278 |
| 2019-11-20 | -0.284 |
| 2019-11-21 | -0.294 |
| 2019-11-22 | -0.287 |
| 2019-11-25 | -0.279 |
| 2019-11-26 | -0.254 |
| 2019-11-27 | -0.224 |
| 2019-11-28 | -0.179 |
| 2019-11-29 | -0.138 |
| 2019-12-02 | -0.156 |
| 2019-12-03 | -0.147 |
| 2019-12-04 | -0.113 |
| 2019-12-05 | -0.128 |
| 2019-12-06 | -0.126 |
| 2019-12-09 | -0.132 |
| 2019-12-10 | -0.11 |
| 2019-12-11 | -0.096 |
| 2019-12-12 | -0.15 |
| 2019-12-13 | -0.132 |
| 2019-12-16 | -0.182 |
| 2019-12-17 | -0.211 |
| 2019-12-18 | -0.196 |
| 2019-12-19 | -0.251 |
| 2019-12-20 | -0.257 |
| 2019-12-23 | -0.259 |
| 2019-12-24 | -0.253 |
| 2019-12-25 | -0.253 |
| 2019-12-26 | -0.254 |
| 2019-12-27 | -0.256 |
| 2019-12-30 | -0.25 |
| 2019-12-31 | -0.251 |
| 2020-01-01 | -0.253 |
| 2020-01-02 | -0.24 |
| 2020-01-03 | -0.253 |
| 2020-01-06 | -0.198 |
| 2020-01-07 | -0.201 |
| 2020-01-08 | -0.225 |
| 2020-01-09 | -0.23 |
| 2020-01-10 | -0.21 |
| 2020-01-13 | -0.233 |
| 2020-01-14 | -0.249 |
| 2020-01-15 | -0.265 |
| 2020-01-16 | -0.296 |
| 2020-01-17 | -0.296 |
| 2020-01-20 | -0.26 |
| 2020-01-21 | -0.277 |
| 2020-01-22 | -0.25 |
| 2020-01-23 | -0.217 |
| 2020-01-24 | -0.193 |
| 2020-01-27 | -0.188 |
| 2020-01-28 | -0.17 |
| 2020-01-29 | -0.17 |
| 2020-01-30 | -0.168 |
| 2020-01-31 | -0.154 |
| 2020-02-03 | -0.169 |
| 2020-02-04 | -0.19 |
| 2020-02-05 | -0.174 |
| 2020-02-06 | -0.151 |
| 2020-02-07 | -0.173 |
| 2020-02-10 | -0.173 |
| 2020-02-11 | -0.21 |
| 2020-02-12 | -0.186 |
| 2020-02-13 | -0.188 |
| 2020-02-14 | -0.202 |
| 2020-02-17 | -0.201 |
| 2020-02-18 | -0.199 |
| 2020-02-19 | -0.2 |
| 2020-02-20 | -0.197 |
| 2020-02-21 | -0.214 |
| 2020-02-24 | -0.217 |
| 2020-02-25 | -0.201 |
| 2020-02-26 | -0.201 |
| 2020-02-27 | -0.192 |
| 2020-02-28 | -0.197 |
| 2020-03-02 | -0.214 |
| 2020-03-03 | -0.157 |
| 2020-03-04 | -0.174 |
| 2020-03-05 | -0.24 |
| 2020-03-06 | -0.26 |
| 2020-03-09 | -0.313 |
| 2020-03-10 | -0.309 |
| 2020-03-11 | -0.32 |
| 2020-03-12 | -0.245 |
| 2020-03-13 | -0.297 |
| 2020-03-16 | -0.326 |
| 2020-03-17 | -0.396 |
| 2020-03-18 | -0.378 |
| 2020-03-19 | -0.302 |
| 2020-03-20 | -0.414 |
| 2020-03-23 | -0.444 |
| 2020-03-24 | -0.528 |
| 2020-03-25 | -0.588 |
| 2020-03-26 | -0.63 |
| 2020-03-27 | -0.586 |
| 2020-03-30 | -0.611 |
| 2020-03-31 | -0.599 |
| 2020-04-01 | -0.57 |
| 2020-04-02 | -0.545 |
| 2020-04-03 | -0.511 |
| 2020-04-06 | -0.523 |
| 2020-04-07 | -0.539 |
| 2020-04-08 | -0.533 |
| 2020-04-09 | -0.52 |
| 2020-04-10 | -0.52 |
| 2020-04-13 | -0.553 |
| 2020-04-14 | -0.556 |
| 2020-04-15 | -0.534 |
| 2020-04-16 | -0.489 |
| 2020-04-17 | -0.464 |
| 2020-04-20 | -0.473 |
| 2020-04-21 | -0.456 |
| 2020-04-22 | -0.402 |
| 2020-04-23 | -0.389 |
| 2020-04-24 | -0.363 |
| 2020-04-27 | -0.371 |
| 2020-04-28 | -0.359 |
| 2020-04-29 | -0.36 |
| 2020-04-30 | -0.364 |
| 2020-05-01 | -0.363 |
| 2020-05-04 | -0.358 |
| 2020-05-05 | -0.324 |
| 2020-05-06 | -0.348 |
| 2020-05-07 | -0.34 |
| 2020-05-08 | -0.321 |
| 2020-05-11 | -0.301 |
| 2020-05-12 | -0.299 |
| 2020-05-13 | -0.342 |
| 2020-05-14 | -0.328 |
| 2020-05-15 | -0.351 |
| 2020-05-18 | -0.346 |
| 2020-05-19 | -0.362 |
| 2020-05-20 | -0.362 |
| 2020-05-21 | -0.364 |
| 2020-05-22 | -0.368 |
| 2020-05-25 | -0.375 |
| 2020-05-26 | -0.363 |
| 2020-05-27 | -0.409 |
| 2020-05-28 | -0.377 |
| 2020-05-29 | -0.366 |
| 2020-06-01 | -0.337 |
| 2020-06-02 | -0.276 |
| 2020-06-03 | -0.292 |
| 2020-06-04 | -0.275 |
| 2020-06-05 | -0.261 |
| 2020-06-08 | -0.239 |
| 2020-06-09 | -0.21 |
| 2020-06-10 | -0.186 |
| 2020-06-11 | -0.193 |
| 2020-06-12 | -0.172 |
| 2020-06-15 | -0.216 |
| 2020-06-16 | -0.236 |
| 2020-06-17 | -0.217 |
| 2020-06-18 | -0.256 |
| 2020-06-19 | -0.241 |
| 2020-06-22 | -0.21 |
| 2020-06-23 | -0.208 |
| 2020-06-24 | -0.201 |
| 2020-06-25 | -0.174 |
| 2020-06-26 | -0.17 |
| 2020-06-29 | -0.172 |
| 2020-06-30 | -0.178 |
| 2020-07-01 | -0.19 |
| 2020-07-02 | -0.248 |
| 2020-07-03 | -0.255 |
| 2020-07-06 | -0.365 |
| 2020-07-07 | -0.368 |
| 2020-07-08 | -0.352 |
| 2020-07-09 | -0.308 |
| 2020-07-10 | -0.276 |
| 2020-07-13 | -0.292 |
| 2020-07-14 | -0.329 |
| 2020-07-15 | -0.295 |
| 2020-07-16 | -0.295 |
| 2020-07-17 | -0.288 |
| 2020-07-20 | -0.251 |
| 2020-07-21 | -0.301 |
| 2020-07-22 | -0.34 |
| 2020-07-23 | -0.328 |
| 2020-07-24 | -0.381 |
| 2020-07-27 | -0.402 |
| 2020-07-28 | -0.407 |
| 2020-07-29 | -0.438 |
| 2020-07-30 | -0.458 |
| 2020-07-31 | -0.451 |
| 2020-08-03 | -0.473 |
| 2020-08-04 | -0.486 |
| 2020-08-05 | -0.431 |
| 2020-08-06 | -0.393 |
| 2020-08-07 | -0.344 |
| 2020-08-10 | -0.385 |
| 2020-08-11 | -0.349 |
| 2020-08-12 | -0.348 |
| 2020-08-13 | -0.407 |
| 2020-08-14 | -0.407 |
| 2020-08-17 | -0.422 |
| 2020-08-18 | -0.418 |
| 2020-08-19 | -0.402 |
| 2020-08-20 | -0.361 |
| 2020-08-21 | -0.345 |
| 2020-08-24 | -0.319 |
| 2020-08-25 | -0.3 |
| 2020-08-26 | -0.32 |
| 2020-08-27 | -0.332 |
| 2020-08-28 | -0.349 |
| 2020-08-31 | -0.388 |
| 2020-09-01 | -0.428 |
| 2020-09-02 | -0.363 |
| 2020-09-03 | -0.394 |
| 2020-09-04 | -0.386 |
| 2020-09-07 | -0.385 |
| 2020-09-08 | -0.387 |
| 2020-09-09 | -0.389 |
| 2020-09-10 | -0.386 |
| 2020-09-11 | -0.379 |
| 2020-09-14 | -0.379 |
| 2020-09-15 | -0.428 |
| 2020-09-16 | -0.386 |
| 2020-09-17 | -0.388 |
| 2020-09-18 | -0.389 |
| 2020-09-21 | -0.387 |
| 2020-09-22 | -0.385 |
| 2020-09-23 | -0.374 |
| 2020-09-24 | -0.357 |
| 2020-09-25 | -0.343 |
| 2020-09-28 | -0.33 |
| 2020-09-29 | -0.333 |
| 2020-09-30 | -0.349 |
| 2020-10-01 | -0.349 |
| 2020-10-02 | -0.361 |
| 2020-10-05 | -0.35 |
| 2020-10-06 | -0.315 |
| 2020-10-07 | -0.317 |
| 2020-10-08 | -0.325 |
| 2020-10-09 | -0.339 |
| 2020-10-12 | -0.34 |
| 2020-10-13 | -0.354 |
| 2020-10-14 | -0.373 |
| 2020-10-15 | -0.37 |
| 2020-10-16 | -0.373 |
| 2020-10-19 | -0.334 |
| 2020-10-20 | -0.316 |
| 2020-10-21 | -0.308 |
| 2020-10-22 | -0.325 |
| 2020-10-23 | -0.346 |
| 2020-10-26 | -0.336 |
| 2020-10-27 | -0.343 |
| 2020-10-28 | -0.336 |
| 2020-10-29 | -0.34 |
| 2020-10-30 | -0.327 |
| 2020-11-02 | -0.325 |
| 2020-11-03 | -0.271 |
| 2020-11-04 | -0.284 |
| 2020-11-05 | -0.294 |
| 2020-11-06 | -0.294 |
| 2020-11-09 | -0.256 |
| 2020-11-10 | -0.281 |
| 2020-11-11 | -0.291 |
| 2020-11-12 | -0.283 |
| 2020-11-13 | -0.297 |
| 2020-11-16 | -0.311 |
| 2020-11-17 | -0.307 |
| 2020-11-18 | -0.298 |
| 2020-11-19 | -0.286 |
| 2020-11-20 | -0.277 |
| 2020-11-23 | -0.232 |
| 2020-11-24 | -0.197 |
| 2020-11-25 | -0.214 |
| 2020-11-26 | -0.21 |
| 2020-11-27 | -0.222 |
| 2020-11-30 | -0.249 |
| 2020-12-01 | -0.241 |
| 2020-12-02 | -0.194 |
| 2020-12-03 | -0.188 |
| 2020-12-04 | -0.163 |
| 2020-12-07 | -0.241 |
| 2020-12-08 | -0.241 |
| 2020-12-09 | -0.268 |
| 2020-12-10 | -0.308 |
| 2020-12-11 | -0.359 |
| 2020-12-14 | -0.359 |
| 2020-12-15 | -0.354 |
| 2020-12-16 | -0.344 |
| 2020-12-17 | -0.358 |
| 2020-12-18 | -0.34 |
| 2020-12-21 | -0.347 |
| 2020-12-22 | -0.336 |
| 2020-12-23 | -0.339 |
| 2020-12-24 | -0.332 |
| 2020-12-25 | -0.333 |
| 2020-12-28 | -0.33 |
| 2020-12-29 | -0.313 |
| 2020-12-30 | -0.29 |
| 2020-12-31 | -0.291 |
| 2021-01-01 | -0.292 |
| 2021-01-04 | -0.271 |
| 2021-01-05 | -0.297 |
| 2021-01-06 | -0.247 |
| 2021-01-07 | -0.249 |
| 2021-01-08 | -0.247 |
| 2021-01-11 | -0.259 |
| 2021-01-12 | -0.26 |
| 2021-01-13 | -0.29 |
| 2021-01-14 | -0.259 |
| 2021-01-15 | -0.273 |
| 2021-01-18 | -0.271 |
| 2021-01-19 | -0.251 |
| 2021-01-20 | -0.251 |
| 2021-01-21 | -0.229 |
| 2021-01-22 | -0.221 |
| 2021-01-25 | -0.214 |
| 2021-01-26 | -0.203 |
| 2021-01-27 | -0.192 |
| 2021-01-28 | -0.186 |
| 2021-01-29 | -0.188 |
| 2021-02-01 | -0.17 |
| 2021-02-02 | -0.168 |
| 2021-02-03 | -0.125 |
| 2021-02-04 | -0.11 |
| 2021-02-05 | -0.152 |
| 2021-02-08 | -0.127 |
| 2021-02-09 | -0.147 |
| 2021-02-10 | -0.153 |
| 2021-02-11 | -0.125 |
| 2021-02-12 | -0.118 |
| 2021-02-15 | -0.107 |
| 2021-02-16 | -0.119 |
| 2021-02-17 | -0.145 |
| 2021-02-18 | -0.115 |
| 2021-02-19 | -0.078 |
| 2021-02-22 | -0.081 |
| 2021-02-23 | -0.095 |
| 2021-02-24 | -0.109 |
| 2021-02-25 | -0.114 |
| 2021-02-26 | -0.109 |
| 2021-03-01 | -0.055 |
| 2021-03-02 | 0 |
| 2021-03-03 | 0.004 |
| 2021-03-04 | 0.007 |
| 2021-03-05 | -0.019 |
| 2021-03-08 | -0.06 |
| 2021-03-09 | -0.074 |
| 2021-03-10 | -0.053 |
| 2021-03-11 | -0.071 |
| 2021-03-12 | -0.089 |
| 2021-03-15 | -0.119 |
| 2021-03-16 | -0.095 |
| 2021-03-17 | -0.062 |
| 2021-03-18 | -0.033 |
| 2021-03-19 | -0.04 |
| 2021-03-22 | -0.019 |
| 2021-03-23 | -0.019 |
| 2021-03-24 | -0.036 |
| 2021-03-25 | -0.087 |
| 2021-03-26 | -0.115 |
| 2021-03-29 | -0.155 |
| 2021-03-30 | -0.193 |
| 2021-03-31 | -0.197 |
| 2021-04-01 | -0.239 |
| 2021-04-02 | -0.239 |
| 2021-04-05 | -0.219 |
| 2021-04-06 | -0.215 |
| 2021-04-07 | -0.183 |
| 2021-04-08 | -0.163 |
| 2021-04-09 | -0.154 |
| 2021-04-12 | -0.158 |
| 2021-04-13 | -0.187 |
| 2021-04-14 | -0.222 |
| 2021-04-15 | -0.223 |
| 2021-04-16 | -0.209 |
| 2021-04-19 | -0.174 |
| 2021-04-20 | -0.191 |
| 2021-04-21 | -0.209 |
| 2021-04-22 | -0.212 |
| 2021-04-23 | -0.22 |
| 2021-04-26 | -0.212 |
| 2021-04-27 | -0.196 |
| 2021-04-28 | -0.185 |
| 2021-04-29 | -0.203 |
| 2021-04-30 | -0.273 |
| 2021-05-03 | -0.253 |
| 2021-05-04 | -0.261 |
| 2021-05-05 | -0.255 |
| 2021-05-06 | -0.247 |
| 2021-05-07 | -0.267 |
| 2021-05-10 | -0.253 |
| 2021-05-11 | -0.231 |
| 2021-05-12 | -0.206 |
| 2021-05-13 | -0.212 |
| 2021-05-14 | -0.204 |
| 2021-05-17 | -0.16 |
| 2021-05-18 | -0.179 |
| 2021-05-19 | -0.15 |
| 2021-05-20 | -0.089 |
| 2021-05-21 | -0.089 |
| 2021-05-24 | -0.101 |
| 2021-05-25 | -0.089 |
| 2021-05-26 | -0.095 |
| 2021-05-27 | -0.11 |
| 2021-05-28 | -0.134 |
| 2021-05-31 | -0.124 |
| 2021-06-01 | -0.152 |
| 2021-06-02 | -0.132 |
| 2021-06-03 | -0.11 |
| 2021-06-04 | -0.117 |
| 2021-06-07 | -0.124 |
| 2021-06-08 | -0.12 |
| 2021-06-09 | -0.129 |
| 2021-06-10 | -0.143 |
| 2021-06-11 | -0.025 |
| 2021-06-14 | -0.021 |
| 2021-06-15 | -0.022 |
| 2021-06-16 | -0.038 |
| 2021-06-17 | -0.02 |
| 2021-06-18 | -0.031 |
| 2021-06-21 | -0.031 |
| 2021-06-22 | -0.016 |
| 2021-06-23 | -0.041 |
| 2021-06-24 | -0.066 |
| 2021-06-25 | -0.106 |
| 2021-06-28 | -0.106 |
| 2021-06-29 | -0.092 |
| 2021-06-30 | -0.079 |
| 2021-07-01 | -0.053 |
| 2021-07-02 | -0.033 |
| 2021-07-05 | -0.027 |
| 2021-07-06 | -0.086 |
| 2021-07-07 | -0.108 |
| 2021-07-08 | -0.139 |
| 2021-07-09 | -0.135 |
| 2021-07-12 | -0.112 |
| 2021-07-13 | -0.106 |
| 2021-07-14 | -0.133 |
| 2021-07-15 | -0.125 |
| 2021-07-16 | -0.125 |
| 2021-07-19 | -0.112 |
| 2021-07-20 | -0.077 |
| 2021-07-21 | -0.039 |
| 2021-07-22 | -0.055 |
| 2021-07-23 | -0.032 |
| 2021-07-26 | -0.026 |
| 2021-07-27 | -0.065 |
| 2021-07-28 | -0.069 |
| 2021-07-29 | -0.073 |
| 2021-07-30 | -0.062 |
| 2021-08-02 | -0.068 |
| 2021-08-03 | -0.033 |
| 2021-08-04 | -0.004 |
| 2021-08-05 | -0.023 |
| 2021-08-06 | -0.026 |
| 2021-08-09 | -0.008 |
| 2021-08-10 | -0.021 |
| 2021-08-11 | 0.081 |
| 2021-08-12 | 0.093 |
| 2021-08-13 | 0.113 |
| 2021-08-16 | 0.135 |
| 2021-08-17 | 0.071 |
| 2021-08-18 | -0.008 |
| 2021-08-19 | 0.008 |
| 2021-08-20 | 0.042 |
| 2021-08-23 | 0.054 |
| 2021-08-24 | 0.047 |
| 2021-08-25 | 0.031 |
| 2021-08-26 | 0.024 |
| 2021-08-27 | -0.017 |
| 2021-08-30 | -0.028 |
| 2021-08-31 | -0.025 |
| 2021-09-01 | -0.065 |
| 2021-09-02 | -0.035 |
| 2021-09-03 | 0.013 |
| 2021-09-06 | 0.031 |
| 2021-09-07 | 0.019 |
| 2021-09-08 | 0.093 |
| 2021-09-09 | 0.149 |
| 2021-09-10 | 0.163 |
| 2021-09-13 | 0.059 |
| 2021-09-14 | 0.131 |
| 2021-09-15 | 0.118 |
| 2021-09-16 | 0.122 |
| 2021-09-17 | 0.122 |
| 2021-09-20 | 0.081 |
| 2021-09-21 | 0.074 |
| 2021-09-22 | 0.092 |
| 2021-09-23 | 0.087 |
| 2021-09-24 | 0.057 |
| 2021-09-27 | 0.079 |
| 2021-09-28 | 0.128 |
| 2021-09-29 | 0.121 |
| 2021-09-30 | 0.066 |
| 2021-10-01 | 0.022 |
| 2021-10-04 | 0.03 |
| 2021-10-05 | 0.017 |
| 2021-10-06 | 0.029 |
| 2021-10-07 | 0.007 |
| 2021-10-08 | 0.004 |
| 2021-10-11 | 0.004 |
| 2021-10-12 | -0.005 |
| 2021-10-13 | -0.113 |
| 2021-10-14 | -0.307 |
| 2021-10-15 | -0.274 |
| 2021-10-18 | -0.248 |
| 2021-10-19 | -0.164 |
| 2021-10-20 | -0.142 |
| 2021-10-21 | -0.116 |
| 2021-10-22 | -0.094 |
| 2021-10-25 | -0.096 |
| 2021-10-26 | -0.012 |
| 2021-10-27 | 0.046 |
| 2021-10-28 | 0.067 |
| 2021-10-29 | 0.204 |
| 2021-11-01 | 0.204 |
| 2021-11-02 | 0.278 |
| 2021-11-03 | 0.354 |
| 2021-11-04 | 0.475 |
| 2021-11-05 | 0.43 |
| 2021-11-08 | 0.486 |
| 2021-11-09 | 0.478 |
| 2021-11-10 | 0.429 |
| 2021-11-11 | 0.465 |
| 2021-11-12 | 0.41 |
| 2021-11-15 | 0.41 |
| 2021-11-16 | 0.418 |
| 2021-11-17 | 0.395 |
| 2021-11-18 | 0.456 |
| 2021-11-19 | 0.432 |
| 2021-11-22 | 0.196 |
| 2021-11-23 | 0.13 |
| 2021-11-24 | 0.054 |
| 2021-11-25 | 0.042 |
| 2021-11-26 | 0.039 |
| 2021-11-29 | 0.028 |
| 2021-11-30 | 0.04 |
| 2021-12-01 | 0.026 |
| 2021-12-02 | 0.006 |
| 2021-12-03 | -0.013 |
| 2021-12-06 | 0.026 |
| 2021-12-07 | 0.056 |
| 2021-12-08 | 0.056 |
| 2021-12-09 | 0.053 |
| 2021-12-10 | 0.105 |
| 2021-12-13 | 0.175 |
| 2021-12-14 | 0.193 |
| 2021-12-15 | 0.262 |
| 2021-12-16 | 0.327 |
| 2021-12-17 | 0.387 |
| 2021-12-20 | 0.395 |
| 2021-12-21 | 0.399 |
| 2021-12-22 | 0.372 |
| 2021-12-23 | 0.271 |
| 2021-12-24 | 0.259 |
| 2021-12-27 | 0.214 |
| 2021-12-28 | 0.229 |
| 2021-12-29 | 0.245 |
| 2021-12-30 | 0.225 |
| 2021-12-31 | 0.225 |
| 2022-01-03 | 0.247 |
| 2022-01-04 | 0.267 |
| 2022-01-05 | 0.319 |
| 2022-01-06 | 0.344 |
| 2022-01-07 | 0.404 |
| 2022-01-10 | 0.507 |
| 2022-01-11 | 0.543 |
| 2022-01-12 | 0.591 |
| 2022-01-13 | 0.754 |
| 2022-01-14 | 0.703 |
| 2022-01-17 | 0.727 |
| 2022-01-18 | 0.684 |
| 2022-01-19 | 0.636 |
| 2022-01-20 | 0.643 |
| 2022-01-21 | 0.574 |
| 2022-01-24 | 0.531 |
| 2022-01-25 | 0.496 |
| 2022-01-26 | 0.551 |
| 2022-01-27 | 0.476 |
| 2022-01-28 | 0.495 |
| 2022-01-31 | 0.571 |
| 2022-02-01 | 0.648 |
| 2022-02-02 | 0.659 |
| 2022-02-03 | 0.683 |
| 2022-02-04 | 0.654 |
| 2022-02-07 | 0.606 |
| 2022-02-08 | 0.517 |
| 2022-02-09 | 0.444 |
| 2022-02-10 | 0.398 |
| 2022-02-11 | 0.263 |
| 2022-02-14 | 0.277 |
| 2022-02-15 | 0.305 |
| 2022-02-16 | 0.382 |
| 2022-02-17 | 0.414 |
| 2022-02-18 | 0.515 |
| 2022-02-21 | 0.492 |
| 2022-02-22 | 0.477 |
| 2022-02-23 | 0.59 |
| 2022-02-24 | 0.683 |
| 2022-02-25 | 0.714 |
| 2022-02-28 | 0.759 |
| 2022-03-01 | 0.834 |
| 2022-03-02 | 0.88 |
| 2022-03-03 | 0.933 |
| 2022-03-04 | 1.051 |
| 2022-03-07 | 1.295 |
| 2022-03-08 | 1.375 |
| 2022-03-09 | 1.38 |
| 2022-03-10 | 1.39 |
| 2022-03-11 | 1.349 |
| 2022-03-14 | 1.211 |
| 2022-03-15 | 1.061 |
| 2022-03-16 | 1.019 |
| 2022-03-17 | 0.99 |
| 2022-03-18 | 0.989 |
| 2022-03-21 | 1.115 |
| 2022-03-22 | 1.264 |
| 2022-03-23 | 1.219 |
| 2022-03-24 | 1.231 |